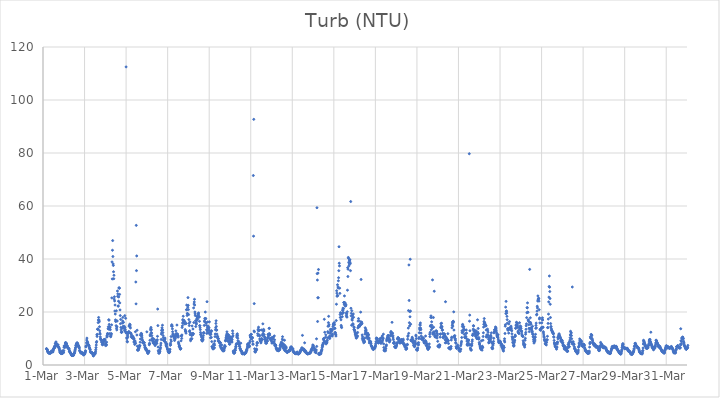
| Category | Turb (NTU) |
|---|---|
| 44986.166666666664 | 6.18 |
| 44986.177083333336 | 6.12 |
| 44986.1875 | 5.9 |
| 44986.197916666664 | 5.86 |
| 44986.208333333336 | 5.73 |
| 44986.21875 | 5.27 |
| 44986.229166666664 | 5.1 |
| 44986.239583333336 | 4.85 |
| 44986.25 | 4.82 |
| 44986.260416666664 | 4.63 |
| 44986.270833333336 | 4.62 |
| 44986.28125 | 4.55 |
| 44986.291666666664 | 4.5 |
| 44986.302083333336 | 4.49 |
| 44986.3125 | 4.48 |
| 44986.322916666664 | 4.6 |
| 44986.333333333336 | 4.53 |
| 44986.34375 | 4.53 |
| 44986.354166666664 | 4.52 |
| 44986.364583333336 | 4.47 |
| 44986.375 | 4.61 |
| 44986.385416666664 | 4.98 |
| 44986.395833333336 | 4.78 |
| 44986.40625 | 5.3 |
| 44986.416666666664 | 4.98 |
| 44986.427083333336 | 5.11 |
| 44986.4375 | 5.06 |
| 44986.447916666664 | 5.04 |
| 44986.458333333336 | 5.05 |
| 44986.46875 | 5.02 |
| 44986.479166666664 | 4.93 |
| 44986.489583333336 | 5.87 |
| 44986.5 | 5.56 |
| 44986.510416666664 | 6.14 |
| 44986.520833333336 | 6.33 |
| 44986.53125 | 6.27 |
| 44986.541666666664 | 6.72 |
| 44986.552083333336 | 6.91 |
| 44986.5625 | 7.16 |
| 44986.572916666664 | 6.56 |
| 44986.583333333336 | 7.16 |
| 44986.59375 | 8.08 |
| 44986.604166666664 | 8.12 |
| 44986.614583333336 | 8.3 |
| 44986.625 | 8.73 |
| 44986.635416666664 | 7.89 |
| 44986.645833333336 | 7.93 |
| 44986.65625 | 8.1 |
| 44986.666666666664 | 7.72 |
| 44986.677083333336 | 7.46 |
| 44986.6875 | 7.51 |
| 44986.697916666664 | 7.24 |
| 44986.708333333336 | 7.03 |
| 44986.71875 | 6.9 |
| 44986.729166666664 | 7.59 |
| 44986.739583333336 | 6.91 |
| 44986.75 | 6.83 |
| 44986.760416666664 | 6.71 |
| 44986.770833333336 | 6.43 |
| 44986.78125 | 6.29 |
| 44986.791666666664 | 5.84 |
| 44986.802083333336 | 5.43 |
| 44986.8125 | 5.01 |
| 44986.822916666664 | 4.8 |
| 44986.833333333336 | 4.74 |
| 44986.84375 | 4.54 |
| 44986.854166666664 | 4.62 |
| 44986.864583333336 | 4.36 |
| 44986.875 | 4.46 |
| 44986.885416666664 | 4.5 |
| 44986.895833333336 | 4.33 |
| 44986.90625 | 4.3 |
| 44986.916666666664 | 4.3 |
| 44986.927083333336 | 5.36 |
| 44986.9375 | 5.03 |
| 44986.947916666664 | 4.44 |
| 44986.958333333336 | 4.77 |
| 44986.96875 | 4.68 |
| 44986.979166666664 | 4.9 |
| 44986.989583333336 | 4.69 |
| 44987.0 | 5.44 |
| 44987.010416666664 | 6.67 |
| 44987.020833333336 | 7.22 |
| 44987.03125 | 7.02 |
| 44987.041666666664 | 7.05 |
| 44987.052083333336 | 6.6 |
| 44987.0625 | 7.36 |
| 44987.072916666664 | 8.28 |
| 44987.083333333336 | 8.46 |
| 44987.09375 | 8.22 |
| 44987.104166666664 | 8.01 |
| 44987.114583333336 | 8.29 |
| 44987.125 | 8.19 |
| 44987.135416666664 | 7.9 |
| 44987.145833333336 | 7.19 |
| 44987.15625 | 7.32 |
| 44987.166666666664 | 7.21 |
| 44987.177083333336 | 6.67 |
| 44987.1875 | 6.68 |
| 44987.197916666664 | 6.45 |
| 44987.208333333336 | 6.35 |
| 44987.21875 | 6.34 |
| 44987.229166666664 | 6.24 |
| 44987.239583333336 | 6.13 |
| 44987.25 | 6.21 |
| 44987.260416666664 | 5.71 |
| 44987.270833333336 | 5.1 |
| 44987.28125 | 5.09 |
| 44987.291666666664 | 5.18 |
| 44987.302083333336 | 4.8 |
| 44987.3125 | 4.66 |
| 44987.322916666664 | 4.48 |
| 44987.333333333336 | 4.47 |
| 44987.34375 | 4.23 |
| 44987.354166666664 | 4.1 |
| 44987.364583333336 | 4.06 |
| 44987.375 | 3.68 |
| 44987.385416666664 | 3.62 |
| 44987.395833333336 | 3.59 |
| 44987.40625 | 3.58 |
| 44987.416666666664 | 3.59 |
| 44987.427083333336 | 3.65 |
| 44987.4375 | 3.95 |
| 44987.447916666664 | 3.76 |
| 44987.458333333336 | 3.65 |
| 44987.46875 | 3.65 |
| 44987.479166666664 | 3.81 |
| 44987.489583333336 | 4.21 |
| 44987.5 | 4.46 |
| 44987.510416666664 | 4.4 |
| 44987.520833333336 | 4.69 |
| 44987.53125 | 5.12 |
| 44987.541666666664 | 5.51 |
| 44987.552083333336 | 5.9 |
| 44987.5625 | 6.43 |
| 44987.572916666664 | 6.68 |
| 44987.583333333336 | 7.37 |
| 44987.59375 | 7.41 |
| 44987.604166666664 | 7.74 |
| 44987.614583333336 | 8.06 |
| 44987.625 | 8.17 |
| 44987.635416666664 | 8.31 |
| 44987.645833333336 | 8.38 |
| 44987.65625 | 7.94 |
| 44987.666666666664 | 8.12 |
| 44987.677083333336 | 7.26 |
| 44987.6875 | 7.14 |
| 44987.697916666664 | 7.44 |
| 44987.708333333336 | 7.34 |
| 44987.71875 | 6.84 |
| 44987.729166666664 | 7.01 |
| 44987.739583333336 | 6.54 |
| 44987.75 | 6.38 |
| 44987.760416666664 | 5.54 |
| 44987.770833333336 | 5.32 |
| 44987.78125 | 5.24 |
| 44987.791666666664 | 4.95 |
| 44987.802083333336 | 4.99 |
| 44987.8125 | 4.64 |
| 44987.822916666664 | 4.57 |
| 44987.833333333336 | 4.54 |
| 44987.84375 | 4.57 |
| 44987.854166666664 | 4.56 |
| 44987.864583333336 | 4.56 |
| 44987.875 | 4.71 |
| 44987.885416666664 | 4.41 |
| 44987.895833333336 | 4.39 |
| 44987.90625 | 4.26 |
| 44987.916666666664 | 4.5 |
| 44987.927083333336 | 4.48 |
| 44987.9375 | 4.16 |
| 44987.947916666664 | 3.76 |
| 44987.958333333336 | 4.1 |
| 44987.96875 | 4.22 |
| 44987.979166666664 | 3.91 |
| 44987.989583333336 | 4.11 |
| 44988.0 | 4.05 |
| 44988.010416666664 | 4.35 |
| 44988.020833333336 | 4.61 |
| 44988.03125 | 4.64 |
| 44988.041666666664 | 5.21 |
| 44988.052083333336 | 5.35 |
| 44988.0625 | 6.8 |
| 44988.072916666664 | 7.1 |
| 44988.083333333336 | 7.31 |
| 44988.09375 | 8.34 |
| 44988.104166666664 | 9.41 |
| 44988.114583333336 | 10.14 |
| 44988.125 | 8.61 |
| 44988.135416666664 | 8.88 |
| 44988.145833333336 | 8.5 |
| 44988.15625 | 8.3 |
| 44988.166666666664 | 7.91 |
| 44988.177083333336 | 7.51 |
| 44988.1875 | 7.52 |
| 44988.197916666664 | 7.39 |
| 44988.208333333336 | 7.39 |
| 44988.21875 | 7.16 |
| 44988.229166666664 | 6.7 |
| 44988.239583333336 | 6.32 |
| 44988.25 | 6.32 |
| 44988.260416666664 | 5.88 |
| 44988.270833333336 | 5.74 |
| 44988.28125 | 5.15 |
| 44988.291666666664 | 4.84 |
| 44988.302083333336 | 4.69 |
| 44988.3125 | 4.85 |
| 44988.322916666664 | 4.64 |
| 44988.333333333336 | 4.63 |
| 44988.34375 | 4.67 |
| 44988.354166666664 | 4.57 |
| 44988.364583333336 | 4.6 |
| 44988.375 | 4.52 |
| 44988.385416666664 | 4.45 |
| 44988.395833333336 | 4.15 |
| 44988.40625 | 4.08 |
| 44988.416666666664 | 3.51 |
| 44988.427083333336 | 3.41 |
| 44988.4375 | 3.85 |
| 44988.447916666664 | 4.25 |
| 44988.458333333336 | 4 |
| 44988.46875 | 3.87 |
| 44988.479166666664 | 4.38 |
| 44988.489583333336 | 4.07 |
| 44988.5 | 4.19 |
| 44988.510416666664 | 4.36 |
| 44988.520833333336 | 4.64 |
| 44988.53125 | 5.17 |
| 44988.541666666664 | 5.81 |
| 44988.552083333336 | 6.57 |
| 44988.5625 | 7.53 |
| 44988.572916666664 | 8.5 |
| 44988.583333333336 | 8.88 |
| 44988.59375 | 11.39 |
| 44988.604166666664 | 10.77 |
| 44988.614583333336 | 11.56 |
| 44988.625 | 13.47 |
| 44988.635416666664 | 13.53 |
| 44988.645833333336 | 13.52 |
| 44988.65625 | 16 |
| 44988.666666666664 | 17.01 |
| 44988.677083333336 | 17.94 |
| 44988.6875 | 16.87 |
| 44988.697916666664 | 16.96 |
| 44988.708333333336 | 16.32 |
| 44988.71875 | 14.43 |
| 44988.729166666664 | 12.91 |
| 44988.739583333336 | 11.99 |
| 44988.75 | 11.63 |
| 44988.760416666664 | 10.58 |
| 44988.770833333336 | 9.96 |
| 44988.78125 | 9.56 |
| 44988.791666666664 | 9.44 |
| 44988.802083333336 | 9.56 |
| 44988.8125 | 9.43 |
| 44988.822916666664 | 8.65 |
| 44988.833333333336 | 9.01 |
| 44988.84375 | 8.42 |
| 44988.854166666664 | 7.78 |
| 44988.864583333336 | 7.63 |
| 44988.875 | 7.7 |
| 44988.885416666664 | 7.94 |
| 44988.895833333336 | 8.6 |
| 44988.90625 | 8.61 |
| 44988.916666666664 | 8.94 |
| 44988.927083333336 | 9.29 |
| 44988.9375 | 9.59 |
| 44988.947916666664 | 9.4 |
| 44988.958333333336 | 9.59 |
| 44988.96875 | 9.64 |
| 44988.979166666664 | 9.59 |
| 44988.989583333336 | 9.13 |
| 44989.0 | 8.08 |
| 44989.010416666664 | 7.32 |
| 44989.020833333336 | 7.73 |
| 44989.03125 | 7.8 |
| 44989.041666666664 | 7.79 |
| 44989.052083333336 | 7.47 |
| 44989.0625 | 8.61 |
| 44989.072916666664 | 10.52 |
| 44989.083333333336 | 11.16 |
| 44989.09375 | 10.86 |
| 44989.104166666664 | 11.89 |
| 44989.114583333336 | 11.66 |
| 44989.125 | 11.77 |
| 44989.135416666664 | 13.71 |
| 44989.145833333336 | 14.44 |
| 44989.15625 | 13.54 |
| 44989.166666666664 | 17.09 |
| 44989.177083333336 | 16.89 |
| 44989.1875 | 15.32 |
| 44989.197916666664 | 13.7 |
| 44989.208333333336 | 14.44 |
| 44989.21875 | 11.87 |
| 44989.229166666664 | 14.08 |
| 44989.239583333336 | 13.31 |
| 44989.25 | 10.86 |
| 44989.260416666664 | 10.65 |
| 44989.270833333336 | 11.08 |
| 44989.28125 | 11.62 |
| 44989.291666666664 | 11.84 |
| 44989.302083333336 | 15.15 |
| 44989.3125 | 25.32 |
| 44989.322916666664 | 38.91 |
| 44989.333333333336 | 32.48 |
| 44989.34375 | 43.3 |
| 44989.354166666664 | 46.95 |
| 44989.364583333336 | 40.94 |
| 44989.375 | 38.16 |
| 44989.385416666664 | 37.57 |
| 44989.395833333336 | 35.18 |
| 44989.40625 | 32.56 |
| 44989.416666666664 | 33.85 |
| 44989.427083333336 | 24.85 |
| 44989.4375 | 25.73 |
| 44989.447916666664 | 24.17 |
| 44989.458333333336 | 20.37 |
| 44989.46875 | 22.63 |
| 44989.479166666664 | 19.23 |
| 44989.489583333336 | 17.03 |
| 44989.5 | 16.41 |
| 44989.510416666664 | 16.6 |
| 44989.520833333336 | 14.83 |
| 44989.53125 | 20.45 |
| 44989.541666666664 | 13.9 |
| 44989.552083333336 | 13.25 |
| 44989.5625 | 14.42 |
| 44989.572916666664 | 16.61 |
| 44989.583333333336 | 27.91 |
| 44989.59375 | 25.92 |
| 44989.604166666664 | 26.84 |
| 44989.614583333336 | 22.23 |
| 44989.625 | 22.25 |
| 44989.635416666664 | 24.06 |
| 44989.645833333336 | 25.69 |
| 44989.65625 | 29.14 |
| 44989.666666666664 | 29 |
| 44989.677083333336 | 29 |
| 44989.6875 | 26.64 |
| 44989.697916666664 | 23.42 |
| 44989.708333333336 | 20.77 |
| 44989.71875 | 18.66 |
| 44989.729166666664 | 15.59 |
| 44989.739583333336 | 17.21 |
| 44989.75 | 14.17 |
| 44989.760416666664 | 13.27 |
| 44989.770833333336 | 12.32 |
| 44989.78125 | 12.36 |
| 44989.791666666664 | 12.39 |
| 44989.802083333336 | 12.5 |
| 44989.8125 | 13.92 |
| 44989.822916666664 | 15.82 |
| 44989.833333333336 | 16.6 |
| 44989.84375 | 17.97 |
| 44989.854166666664 | 14.15 |
| 44989.864583333336 | 14.62 |
| 44989.875 | 16.1 |
| 44989.885416666664 | 14.27 |
| 44989.895833333336 | 13.9 |
| 44989.90625 | 14.02 |
| 44989.916666666664 | 14.59 |
| 44989.927083333336 | 13.06 |
| 44989.9375 | 18.62 |
| 44989.947916666664 | 14.09 |
| 44989.958333333336 | 13.33 |
| 44989.96875 | 12.68 |
| 44989.979166666664 | 17.62 |
| 44989.989583333336 | 12.21 |
| 44990.0 | 112.49 |
| 44990.010416666664 | 12.25 |
| 44990.020833333336 | 11.98 |
| 44990.03125 | 10.29 |
| 44990.041666666664 | 9.97 |
| 44990.052083333336 | 8.93 |
| 44990.0625 | 8.71 |
| 44990.072916666664 | 11.21 |
| 44990.083333333336 | 10.55 |
| 44990.09375 | 11.98 |
| 44990.104166666664 | 12.37 |
| 44990.114583333336 | 11.99 |
| 44990.125 | 12.37 |
| 44990.135416666664 | 12.62 |
| 44990.145833333336 | 14.63 |
| 44990.15625 | 14.93 |
| 44990.166666666664 | 14.77 |
| 44990.177083333336 | 15.41 |
| 44990.1875 | 14.4 |
| 44990.197916666664 | 15.1 |
| 44990.208333333336 | 13.98 |
| 44990.21875 | 12.08 |
| 44990.229166666664 | 11.99 |
| 44990.239583333336 | 11.71 |
| 44990.25 | 10.77 |
| 44990.260416666664 | 11.34 |
| 44990.270833333336 | 10.38 |
| 44990.28125 | 10.6 |
| 44990.291666666664 | 10.32 |
| 44990.302083333336 | 10.56 |
| 44990.3125 | 10.21 |
| 44990.322916666664 | 10.15 |
| 44990.333333333336 | 10.77 |
| 44990.34375 | 10.19 |
| 44990.354166666664 | 10.15 |
| 44990.364583333336 | 9.9 |
| 44990.375 | 8.66 |
| 44990.385416666664 | 9.85 |
| 44990.395833333336 | 8.82 |
| 44990.40625 | 9.06 |
| 44990.416666666664 | 7.76 |
| 44990.427083333336 | 8.08 |
| 44990.4375 | 9 |
| 44990.447916666664 | 12.56 |
| 44990.458333333336 | 8.24 |
| 44990.46875 | 31.32 |
| 44990.479166666664 | 23.07 |
| 44990.489583333336 | 52.69 |
| 44990.5 | 35.61 |
| 44990.510416666664 | 41.16 |
| 44990.520833333336 | 11.32 |
| 44990.53125 | 13.12 |
| 44990.541666666664 | 7.08 |
| 44990.552083333336 | 5.55 |
| 44990.5625 | 5.92 |
| 44990.572916666664 | 5.82 |
| 44990.583333333336 | 5.64 |
| 44990.59375 | 5.68 |
| 44990.604166666664 | 6.55 |
| 44990.614583333336 | 6.21 |
| 44990.625 | 6.54 |
| 44990.635416666664 | 7.22 |
| 44990.645833333336 | 7.39 |
| 44990.65625 | 7.21 |
| 44990.666666666664 | 7.25 |
| 44990.677083333336 | 8.63 |
| 44990.6875 | 9.83 |
| 44990.697916666664 | 11.24 |
| 44990.708333333336 | 11.64 |
| 44990.71875 | 11.17 |
| 44990.729166666664 | 11.94 |
| 44990.739583333336 | 11.57 |
| 44990.75 | 11.75 |
| 44990.760416666664 | 10.98 |
| 44990.770833333336 | 10.21 |
| 44990.78125 | 9.44 |
| 44990.791666666664 | 9.23 |
| 44990.802083333336 | 8.39 |
| 44990.8125 | 8.38 |
| 44990.822916666664 | 8.58 |
| 44990.833333333336 | 8.63 |
| 44990.84375 | 8.42 |
| 44990.854166666664 | 8.34 |
| 44990.864583333336 | 8.36 |
| 44990.875 | 8.41 |
| 44990.885416666664 | 7.53 |
| 44990.895833333336 | 7.3 |
| 44990.90625 | 6.72 |
| 44990.916666666664 | 6.68 |
| 44990.927083333336 | 6.19 |
| 44990.9375 | 6.33 |
| 44990.947916666664 | 5.9 |
| 44990.958333333336 | 5.65 |
| 44990.96875 | 6.11 |
| 44990.979166666664 | 5.6 |
| 44990.989583333336 | 5.5 |
| 44991.0 | 12.51 |
| 44991.010416666664 | 5.39 |
| 44991.020833333336 | 5.07 |
| 44991.03125 | 4.75 |
| 44991.041666666664 | 4.48 |
| 44991.052083333336 | 4.34 |
| 44991.0625 | 4.79 |
| 44991.072916666664 | 4.67 |
| 44991.083333333336 | 4.8 |
| 44991.09375 | 5.14 |
| 44991.104166666664 | 5.25 |
| 44991.114583333336 | 7.62 |
| 44991.125 | 8.19 |
| 44991.135416666664 | 8 |
| 44991.145833333336 | 9.32 |
| 44991.15625 | 11.02 |
| 44991.166666666664 | 11.54 |
| 44991.177083333336 | 13.25 |
| 44991.1875 | 13.72 |
| 44991.197916666664 | 14.18 |
| 44991.208333333336 | 12.24 |
| 44991.21875 | 13.3 |
| 44991.229166666664 | 12.03 |
| 44991.239583333336 | 11.07 |
| 44991.25 | 9.93 |
| 44991.260416666664 | 9.35 |
| 44991.270833333336 | 9.28 |
| 44991.28125 | 10.11 |
| 44991.291666666664 | 8.9 |
| 44991.302083333336 | 8.4 |
| 44991.3125 | 8.23 |
| 44991.322916666664 | 8.69 |
| 44991.333333333336 | 8.67 |
| 44991.34375 | 9.75 |
| 44991.354166666664 | 8.67 |
| 44991.364583333336 | 7.86 |
| 44991.375 | 7.97 |
| 44991.385416666664 | 8.12 |
| 44991.395833333336 | 7.34 |
| 44991.40625 | 7.66 |
| 44991.416666666664 | 8.11 |
| 44991.427083333336 | 8.36 |
| 44991.4375 | 9.22 |
| 44991.447916666664 | 8.54 |
| 44991.458333333336 | 8.17 |
| 44991.46875 | 9.26 |
| 44991.479166666664 | 8.14 |
| 44991.489583333336 | 9.08 |
| 44991.5 | 9.54 |
| 44991.510416666664 | 10.82 |
| 44991.520833333336 | 21.11 |
| 44991.53125 | 14.87 |
| 44991.541666666664 | 6.78 |
| 44991.552083333336 | 5.45 |
| 44991.5625 | 5.13 |
| 44991.572916666664 | 4.47 |
| 44991.583333333336 | 4.53 |
| 44991.59375 | 4.53 |
| 44991.604166666664 | 4.64 |
| 44991.614583333336 | 4.97 |
| 44991.625 | 5.12 |
| 44991.635416666664 | 5.76 |
| 44991.645833333336 | 6.31 |
| 44991.65625 | 6.64 |
| 44991.666666666664 | 7.5 |
| 44991.677083333336 | 8.24 |
| 44991.6875 | 9.63 |
| 44991.697916666664 | 11.68 |
| 44991.708333333336 | 13.01 |
| 44991.71875 | 12.18 |
| 44991.729166666664 | 14.05 |
| 44991.739583333336 | 13.45 |
| 44991.75 | 15.02 |
| 44991.760416666664 | 13.16 |
| 44991.770833333336 | 12.23 |
| 44991.78125 | 11.12 |
| 44991.791666666664 | 10.27 |
| 44991.802083333336 | 9.41 |
| 44991.8125 | 9.35 |
| 44991.822916666664 | 9.3 |
| 44991.833333333336 | 9.04 |
| 44991.84375 | 9.74 |
| 44991.854166666664 | 9.51 |
| 44991.864583333336 | 10.23 |
| 44991.875 | 9.83 |
| 44991.885416666664 | 8.75 |
| 44991.895833333336 | 8.51 |
| 44991.90625 | 8.42 |
| 44991.916666666664 | 7.96 |
| 44991.927083333336 | 7.27 |
| 44991.9375 | 7.73 |
| 44991.947916666664 | 6.98 |
| 44991.958333333336 | 6.91 |
| 44991.96875 | 7.9 |
| 44991.979166666664 | 6.43 |
| 44991.989583333336 | 6.08 |
| 44992.0 | 5.86 |
| 44992.010416666664 | 5.66 |
| 44992.020833333336 | 5.28 |
| 44992.03125 | 5.03 |
| 44992.041666666664 | 4.97 |
| 44992.052083333336 | 4.72 |
| 44992.0625 | 4.71 |
| 44992.072916666664 | 4.63 |
| 44992.083333333336 | 4.9 |
| 44992.09375 | 4.86 |
| 44992.104166666664 | 5.19 |
| 44992.114583333336 | 5.95 |
| 44992.125 | 7.44 |
| 44992.135416666664 | 8.23 |
| 44992.145833333336 | 7.6 |
| 44992.15625 | 9.49 |
| 44992.166666666664 | 10.74 |
| 44992.177083333336 | 8.97 |
| 44992.1875 | 14.72 |
| 44992.197916666664 | 15.2 |
| 44992.208333333336 | 14.75 |
| 44992.21875 | 14.64 |
| 44992.229166666664 | 13.65 |
| 44992.239583333336 | 12.56 |
| 44992.25 | 11.69 |
| 44992.260416666664 | 11.53 |
| 44992.270833333336 | 10.8 |
| 44992.28125 | 10.82 |
| 44992.291666666664 | 10.91 |
| 44992.302083333336 | 10.58 |
| 44992.3125 | 11 |
| 44992.322916666664 | 9.98 |
| 44992.333333333336 | 9.25 |
| 44992.34375 | 10.03 |
| 44992.354166666664 | 9.78 |
| 44992.364583333336 | 10.12 |
| 44992.375 | 10.66 |
| 44992.385416666664 | 11.68 |
| 44992.395833333336 | 12.88 |
| 44992.40625 | 11.67 |
| 44992.416666666664 | 11.31 |
| 44992.427083333336 | 11.19 |
| 44992.4375 | 11.83 |
| 44992.447916666664 | 15.08 |
| 44992.458333333336 | 10.98 |
| 44992.46875 | 10.69 |
| 44992.479166666664 | 11.67 |
| 44992.489583333336 | 10.68 |
| 44992.5 | 11.09 |
| 44992.510416666664 | 10.54 |
| 44992.520833333336 | 8.62 |
| 44992.53125 | 8.17 |
| 44992.541666666664 | 7.82 |
| 44992.552083333336 | 7.09 |
| 44992.5625 | 7.18 |
| 44992.572916666664 | 7.2 |
| 44992.583333333336 | 6.57 |
| 44992.59375 | 6.46 |
| 44992.604166666664 | 6.05 |
| 44992.614583333336 | 6.05 |
| 44992.625 | 6.05 |
| 44992.635416666664 | 6.22 |
| 44992.645833333336 | 9.12 |
| 44992.65625 | 10.97 |
| 44992.666666666664 | 10.98 |
| 44992.677083333336 | 10.03 |
| 44992.6875 | 11.33 |
| 44992.697916666664 | 14.16 |
| 44992.708333333336 | 14.8 |
| 44992.71875 | 15.84 |
| 44992.729166666664 | 17.13 |
| 44992.739583333336 | 16.75 |
| 44992.75 | 18.4 |
| 44992.760416666664 | 16.65 |
| 44992.770833333336 | 15.77 |
| 44992.78125 | 16.06 |
| 44992.791666666664 | 16.83 |
| 44992.802083333336 | 16.39 |
| 44992.8125 | 15.71 |
| 44992.822916666664 | 16.36 |
| 44992.833333333336 | 15.47 |
| 44992.84375 | 13.36 |
| 44992.854166666664 | 12.88 |
| 44992.864583333336 | 12.52 |
| 44992.875 | 12.71 |
| 44992.885416666664 | 12.01 |
| 44992.895833333336 | 15.68 |
| 44992.90625 | 20.86 |
| 44992.916666666664 | 22.61 |
| 44992.927083333336 | 20.91 |
| 44992.9375 | 18.69 |
| 44992.947916666664 | 19.44 |
| 44992.958333333336 | 19.37 |
| 44992.96875 | 21.82 |
| 44992.979166666664 | 25.43 |
| 44992.989583333336 | 22.52 |
| 44993.0 | 20.91 |
| 44993.010416666664 | 19.03 |
| 44993.020833333336 | 17.15 |
| 44993.03125 | 15.72 |
| 44993.041666666664 | 14.87 |
| 44993.052083333336 | 12.6 |
| 44993.0625 | 12.95 |
| 44993.072916666664 | 16.27 |
| 44993.083333333336 | 11.44 |
| 44993.09375 | 12.13 |
| 44993.104166666664 | 9.15 |
| 44993.114583333336 | 9.78 |
| 44993.125 | 9.81 |
| 44993.135416666664 | 9.66 |
| 44993.145833333336 | 11.4 |
| 44993.15625 | 11.13 |
| 44993.166666666664 | 9.96 |
| 44993.177083333336 | 14.73 |
| 44993.1875 | 11.91 |
| 44993.197916666664 | 11.54 |
| 44993.208333333336 | 11.39 |
| 44993.21875 | 13.59 |
| 44993.229166666664 | 11.86 |
| 44993.239583333336 | 11.74 |
| 44993.25 | 21.54 |
| 44993.260416666664 | 16.03 |
| 44993.270833333336 | 23.01 |
| 44993.28125 | 23.78 |
| 44993.291666666664 | 24.79 |
| 44993.302083333336 | 22.62 |
| 44993.3125 | 20 |
| 44993.322916666664 | 19.31 |
| 44993.333333333336 | 18.63 |
| 44993.34375 | 16.74 |
| 44993.354166666664 | 14.52 |
| 44993.364583333336 | 15.91 |
| 44993.375 | 15.83 |
| 44993.385416666664 | 15.45 |
| 44993.395833333336 | 16.74 |
| 44993.40625 | 17.46 |
| 44993.416666666664 | 18.27 |
| 44993.427083333336 | 17.66 |
| 44993.4375 | 17.26 |
| 44993.447916666664 | 18.24 |
| 44993.458333333336 | 18.85 |
| 44993.46875 | 19.33 |
| 44993.479166666664 | 19.07 |
| 44993.489583333336 | 19.64 |
| 44993.5 | 18.36 |
| 44993.510416666664 | 18.11 |
| 44993.520833333336 | 18.11 |
| 44993.53125 | 16.48 |
| 44993.541666666664 | 14.83 |
| 44993.552083333336 | 14.82 |
| 44993.5625 | 14.06 |
| 44993.572916666664 | 13.33 |
| 44993.583333333336 | 12.29 |
| 44993.59375 | 11.56 |
| 44993.604166666664 | 11.54 |
| 44993.614583333336 | 11.11 |
| 44993.625 | 10.58 |
| 44993.635416666664 | 9.6 |
| 44993.645833333336 | 9.4 |
| 44993.65625 | 9.14 |
| 44993.666666666664 | 9.03 |
| 44993.677083333336 | 9.6 |
| 44993.6875 | 10.09 |
| 44993.697916666664 | 10.29 |
| 44993.708333333336 | 9.49 |
| 44993.71875 | 11.04 |
| 44993.729166666664 | 12.22 |
| 44993.739583333336 | 11.96 |
| 44993.75 | 12.16 |
| 44993.760416666664 | 14.94 |
| 44993.770833333336 | 16.61 |
| 44993.78125 | 16.29 |
| 44993.791666666664 | 17.58 |
| 44993.802083333336 | 17.37 |
| 44993.8125 | 19.98 |
| 44993.822916666664 | 17.45 |
| 44993.833333333336 | 17.57 |
| 44993.84375 | 15.95 |
| 44993.854166666664 | 15.9 |
| 44993.864583333336 | 15 |
| 44993.875 | 13.28 |
| 44993.885416666664 | 11.91 |
| 44993.895833333336 | 23.89 |
| 44993.90625 | 12.81 |
| 44993.916666666664 | 14.16 |
| 44993.927083333336 | 16.24 |
| 44993.9375 | 13.63 |
| 44993.947916666664 | 14.67 |
| 44993.958333333336 | 12.07 |
| 44993.96875 | 13.14 |
| 44993.979166666664 | 14.18 |
| 44993.989583333336 | 14.01 |
| 44994.0 | 13.11 |
| 44994.010416666664 | 16.28 |
| 44994.020833333336 | 12.08 |
| 44994.03125 | 12.39 |
| 44994.041666666664 | 11.69 |
| 44994.052083333336 | 11.42 |
| 44994.0625 | 10.27 |
| 44994.072916666664 | 12.27 |
| 44994.083333333336 | 11.63 |
| 44994.09375 | 12.88 |
| 44994.104166666664 | 10.41 |
| 44994.114583333336 | 12.86 |
| 44994.125 | 8.84 |
| 44994.135416666664 | 6.96 |
| 44994.145833333336 | 6.83 |
| 44994.15625 | 6.69 |
| 44994.166666666664 | 6.42 |
| 44994.177083333336 | 6.08 |
| 44994.1875 | 6.6 |
| 44994.197916666664 | 6.12 |
| 44994.208333333336 | 7.73 |
| 44994.21875 | 6.45 |
| 44994.229166666664 | 6.33 |
| 44994.239583333336 | 8.08 |
| 44994.25 | 6.52 |
| 44994.260416666664 | 7.51 |
| 44994.270833333336 | 9.03 |
| 44994.28125 | 10.71 |
| 44994.291666666664 | 11.68 |
| 44994.302083333336 | 13.28 |
| 44994.3125 | 14.06 |
| 44994.322916666664 | 15.68 |
| 44994.333333333336 | 16.7 |
| 44994.34375 | 14.57 |
| 44994.354166666664 | 13.12 |
| 44994.364583333336 | 13.22 |
| 44994.375 | 11.66 |
| 44994.385416666664 | 10.62 |
| 44994.395833333336 | 10.79 |
| 44994.40625 | 10.75 |
| 44994.416666666664 | 10.1 |
| 44994.427083333336 | 10 |
| 44994.4375 | 9.14 |
| 44994.447916666664 | 9.93 |
| 44994.458333333336 | 8.87 |
| 44994.46875 | 8.99 |
| 44994.479166666664 | 8.92 |
| 44994.489583333336 | 8.54 |
| 44994.5 | 8.67 |
| 44994.510416666664 | 8.17 |
| 44994.520833333336 | 7.25 |
| 44994.53125 | 8.42 |
| 44994.541666666664 | 8.4 |
| 44994.552083333336 | 7.38 |
| 44994.5625 | 6.57 |
| 44994.572916666664 | 6.57 |
| 44994.583333333336 | 6.29 |
| 44994.59375 | 6.17 |
| 44994.604166666664 | 7.6 |
| 44994.614583333336 | 6.08 |
| 44994.625 | 5.68 |
| 44994.635416666664 | 6.18 |
| 44994.645833333336 | 6.4 |
| 44994.65625 | 5.35 |
| 44994.666666666664 | 5.49 |
| 44994.677083333336 | 5.35 |
| 44994.6875 | 5.49 |
| 44994.697916666664 | 5.52 |
| 44994.708333333336 | 5.33 |
| 44994.71875 | 5.69 |
| 44994.729166666664 | 6.22 |
| 44994.739583333336 | 6.88 |
| 44994.75 | 7.39 |
| 44994.760416666664 | 7.08 |
| 44994.770833333336 | 6.92 |
| 44994.78125 | 9.16 |
| 44994.791666666664 | 9.14 |
| 44994.802083333336 | 9.75 |
| 44994.8125 | 10.36 |
| 44994.822916666664 | 10.98 |
| 44994.833333333336 | 10.06 |
| 44994.84375 | 11.66 |
| 44994.854166666664 | 12.52 |
| 44994.864583333336 | 11.56 |
| 44994.875 | 10.78 |
| 44994.885416666664 | 9.86 |
| 44994.895833333336 | 8.98 |
| 44994.90625 | 9.1 |
| 44994.916666666664 | 11.48 |
| 44994.927083333336 | 10.07 |
| 44994.9375 | 11.25 |
| 44994.947916666664 | 10.63 |
| 44994.958333333336 | 8.7 |
| 44994.96875 | 7.91 |
| 44994.979166666664 | 9.23 |
| 44994.989583333336 | 7.84 |
| 44995.0 | 8.71 |
| 44995.010416666664 | 9.93 |
| 44995.020833333336 | 10.63 |
| 44995.03125 | 9.5 |
| 44995.041666666664 | 9.91 |
| 44995.052083333336 | 8.95 |
| 44995.0625 | 8.88 |
| 44995.072916666664 | 9.93 |
| 44995.083333333336 | 8.91 |
| 44995.09375 | 8.61 |
| 44995.104166666664 | 9.59 |
| 44995.114583333336 | 10.6 |
| 44995.125 | 12.88 |
| 44995.135416666664 | 11.87 |
| 44995.145833333336 | 11.01 |
| 44995.15625 | 5.26 |
| 44995.166666666664 | 4.97 |
| 44995.177083333336 | 4.68 |
| 44995.1875 | 4.49 |
| 44995.197916666664 | 4.46 |
| 44995.208333333336 | 4.49 |
| 44995.21875 | 4.66 |
| 44995.229166666664 | 4.79 |
| 44995.239583333336 | 5.8 |
| 44995.25 | 5.6 |
| 44995.260416666664 | 5.52 |
| 44995.270833333336 | 6.38 |
| 44995.28125 | 7.09 |
| 44995.291666666664 | 6.89 |
| 44995.302083333336 | 7.77 |
| 44995.3125 | 8.07 |
| 44995.322916666664 | 10.55 |
| 44995.333333333336 | 11.15 |
| 44995.34375 | 11.54 |
| 44995.354166666664 | 11.77 |
| 44995.364583333336 | 11 |
| 44995.375 | 10.1 |
| 44995.385416666664 | 9.16 |
| 44995.395833333336 | 8.63 |
| 44995.40625 | 7.82 |
| 44995.416666666664 | 8.86 |
| 44995.427083333336 | 8.1 |
| 44995.4375 | 8.1 |
| 44995.447916666664 | 7.71 |
| 44995.458333333336 | 7 |
| 44995.46875 | 7.04 |
| 44995.479166666664 | 6.19 |
| 44995.489583333336 | 6.32 |
| 44995.5 | 6.01 |
| 44995.510416666664 | 5.65 |
| 44995.520833333336 | 8.24 |
| 44995.53125 | 5.49 |
| 44995.541666666664 | 5.2 |
| 44995.552083333336 | 5.23 |
| 44995.5625 | 5.08 |
| 44995.572916666664 | 4.62 |
| 44995.583333333336 | 4.31 |
| 44995.59375 | 4.45 |
| 44995.604166666664 | 4.26 |
| 44995.614583333336 | 4.23 |
| 44995.625 | 4.42 |
| 44995.635416666664 | 4.35 |
| 44995.645833333336 | 4.42 |
| 44995.65625 | 4.35 |
| 44995.666666666664 | 4.34 |
| 44995.677083333336 | 4.32 |
| 44995.6875 | 4.08 |
| 44995.697916666664 | 4.28 |
| 44995.708333333336 | 4.21 |
| 44995.71875 | 4.28 |
| 44995.729166666664 | 4.56 |
| 44995.739583333336 | 4.49 |
| 44995.75 | 4.72 |
| 44995.760416666664 | 4.55 |
| 44995.770833333336 | 4.69 |
| 44995.78125 | 5.08 |
| 44995.791666666664 | 5.32 |
| 44995.802083333336 | 5.82 |
| 44995.8125 | 5.6 |
| 44995.822916666664 | 6.07 |
| 44995.833333333336 | 6.78 |
| 44995.84375 | 7.53 |
| 44995.854166666664 | 7.84 |
| 44995.864583333336 | 7.93 |
| 44995.875 | 8 |
| 44995.885416666664 | 7.94 |
| 44995.895833333336 | 7.35 |
| 44995.90625 | 6.73 |
| 44995.916666666664 | 6.9 |
| 44995.927083333336 | 7.27 |
| 44995.9375 | 7.04 |
| 44995.947916666664 | 8.43 |
| 44995.958333333336 | 9.02 |
| 44995.96875 | 11.24 |
| 44995.979166666664 | 10.6 |
| 44995.989583333336 | 10.56 |
| 44996.0 | 10.57 |
| 44996.010416666664 | 9.82 |
| 44996.020833333336 | 11.58 |
| 44996.03125 | 11.53 |
| 44996.041666666664 | 10.26 |
| 44996.052083333336 | 9.96 |
| 44996.0625 | 10.1 |
| 44996.072916666664 | 10.29 |
| 44996.083333333336 | 10.37 |
| 44996.09375 | 8.92 |
| 44996.104166666664 | 7.85 |
| 44996.114583333336 | 7.88 |
| 44996.125 | 71.5 |
| 44996.135416666664 | 48.62 |
| 44996.145833333336 | 92.7 |
| 44996.15625 | 12.83 |
| 44996.166666666664 | 23.16 |
| 44996.177083333336 | 12.53 |
| 44996.1875 | 6.13 |
| 44996.197916666664 | 5.16 |
| 44996.208333333336 | 4.89 |
| 44996.21875 | 4.96 |
| 44996.229166666664 | 5.02 |
| 44996.239583333336 | 5.62 |
| 44996.25 | 5.39 |
| 44996.260416666664 | 5.61 |
| 44996.270833333336 | 6.06 |
| 44996.28125 | 5.84 |
| 44996.291666666664 | 7.41 |
| 44996.302083333336 | 8.26 |
| 44996.3125 | 8.53 |
| 44996.322916666664 | 8.27 |
| 44996.333333333336 | 11.81 |
| 44996.34375 | 11.12 |
| 44996.354166666664 | 13.45 |
| 44996.364583333336 | 12.95 |
| 44996.375 | 14.27 |
| 44996.385416666664 | 13.27 |
| 44996.395833333336 | 13.24 |
| 44996.40625 | 12.99 |
| 44996.416666666664 | 11.3 |
| 44996.427083333336 | 10.95 |
| 44996.4375 | 9.88 |
| 44996.447916666664 | 9.52 |
| 44996.458333333336 | 9.28 |
| 44996.46875 | 9.01 |
| 44996.479166666664 | 8.9 |
| 44996.489583333336 | 8.34 |
| 44996.5 | 8.72 |
| 44996.510416666664 | 13.21 |
| 44996.520833333336 | 10.01 |
| 44996.53125 | 9.69 |
| 44996.541666666664 | 9.77 |
| 44996.552083333336 | 9.53 |
| 44996.5625 | 11.14 |
| 44996.572916666664 | 11.51 |
| 44996.583333333336 | 15.53 |
| 44996.59375 | 11.91 |
| 44996.604166666664 | 12.99 |
| 44996.614583333336 | 13.44 |
| 44996.625 | 12.75 |
| 44996.635416666664 | 13.18 |
| 44996.645833333336 | 11.41 |
| 44996.65625 | 10.7 |
| 44996.666666666664 | 9.68 |
| 44996.677083333336 | 10.25 |
| 44996.6875 | 9.66 |
| 44996.697916666664 | 10.25 |
| 44996.708333333336 | 8.9 |
| 44996.71875 | 8.24 |
| 44996.729166666664 | 8.79 |
| 44996.739583333336 | 8.33 |
| 44996.75 | 8.64 |
| 44996.760416666664 | 8.2 |
| 44996.770833333336 | 9.24 |
| 44996.78125 | 9.43 |
| 44996.791666666664 | 8.98 |
| 44996.802083333336 | 9.03 |
| 44996.8125 | 10.24 |
| 44996.822916666664 | 10.06 |
| 44996.833333333336 | 11.52 |
| 44996.84375 | 10.84 |
| 44996.854166666664 | 11.51 |
| 44996.864583333336 | 11.48 |
| 44996.875 | 11.78 |
| 44996.885416666664 | 13.84 |
| 44996.895833333336 | 13.83 |
| 44996.90625 | 11.8 |
| 44996.916666666664 | 11.29 |
| 44996.927083333336 | 10.06 |
| 44996.9375 | 9.77 |
| 44996.947916666664 | 9.89 |
| 44996.958333333336 | 9.54 |
| 44996.96875 | 9.45 |
| 44996.979166666664 | 10.03 |
| 44996.989583333336 | 9.41 |
| 44997.0 | 10.32 |
| 44997.010416666664 | 8.88 |
| 44997.020833333336 | 8.25 |
| 44997.03125 | 8.35 |
| 44997.041666666664 | 8.58 |
| 44997.052083333336 | 9.83 |
| 44997.0625 | 10.24 |
| 44997.072916666664 | 10.27 |
| 44997.083333333336 | 10.55 |
| 44997.09375 | 8.61 |
| 44997.104166666664 | 8.29 |
| 44997.114583333336 | 8.62 |
| 44997.125 | 8.74 |
| 44997.135416666664 | 10.97 |
| 44997.145833333336 | 9.52 |
| 44997.15625 | 7.32 |
| 44997.166666666664 | 7.59 |
| 44997.177083333336 | 7.74 |
| 44997.1875 | 7.53 |
| 44997.197916666664 | 7.53 |
| 44997.208333333336 | 7.25 |
| 44997.21875 | 6.45 |
| 44997.229166666664 | 6.36 |
| 44997.239583333336 | 6.34 |
| 44997.25 | 5.9 |
| 44997.260416666664 | 5.66 |
| 44997.270833333336 | 5.85 |
| 44997.28125 | 5.46 |
| 44997.291666666664 | 5.6 |
| 44997.302083333336 | 5.65 |
| 44997.3125 | 5.59 |
| 44997.322916666664 | 5.47 |
| 44997.333333333336 | 5.51 |
| 44997.34375 | 5.37 |
| 44997.354166666664 | 6.1 |
| 44997.364583333336 | 5.7 |
| 44997.375 | 6.07 |
| 44997.385416666664 | 5.75 |
| 44997.395833333336 | 5.79 |
| 44997.40625 | 6.25 |
| 44997.416666666664 | 7.39 |
| 44997.427083333336 | 6.86 |
| 44997.4375 | 7.64 |
| 44997.447916666664 | 7.75 |
| 44997.458333333336 | 8.08 |
| 44997.46875 | 8.58 |
| 44997.479166666664 | 7.89 |
| 44997.489583333336 | 7.13 |
| 44997.5 | 7.28 |
| 44997.510416666664 | 8.28 |
| 44997.520833333336 | 9.75 |
| 44997.53125 | 10.68 |
| 44997.541666666664 | 9.4 |
| 44997.552083333336 | 7.66 |
| 44997.5625 | 6.6 |
| 44997.572916666664 | 7.92 |
| 44997.583333333336 | 6.2 |
| 44997.59375 | 6.33 |
| 44997.604166666664 | 6.75 |
| 44997.614583333336 | 5.95 |
| 44997.625 | 9.34 |
| 44997.635416666664 | 5.46 |
| 44997.645833333336 | 7.39 |
| 44997.65625 | 5.5 |
| 44997.666666666664 | 5.29 |
| 44997.677083333336 | 5.53 |
| 44997.6875 | 6.54 |
| 44997.697916666664 | 6.84 |
| 44997.708333333336 | 6.41 |
| 44997.71875 | 5.19 |
| 44997.729166666664 | 5.01 |
| 44997.739583333336 | 4.94 |
| 44997.75 | 4.85 |
| 44997.760416666664 | 4.71 |
| 44997.770833333336 | 4.85 |
| 44997.78125 | 5.1 |
| 44997.791666666664 | 5.05 |
| 44997.802083333336 | 5.27 |
| 44997.8125 | 5.08 |
| 44997.822916666664 | 5.41 |
| 44997.833333333336 | 5.22 |
| 44997.84375 | 5.48 |
| 44997.854166666664 | 5.33 |
| 44997.864583333336 | 5.26 |
| 44997.875 | 5.49 |
| 44997.885416666664 | 5.46 |
| 44997.895833333336 | 5.63 |
| 44997.90625 | 6.13 |
| 44997.916666666664 | 6.51 |
| 44997.927083333336 | 6.69 |
| 44997.9375 | 6.78 |
| 44997.947916666664 | 6.86 |
| 44997.958333333336 | 6.49 |
| 44997.96875 | 6.6 |
| 44997.979166666664 | 6.04 |
| 44997.989583333336 | 6.06 |
| 44998.0 | 6.14 |
| 44998.010416666664 | 6.18 |
| 44998.020833333336 | 5.86 |
| 44998.03125 | 6.1 |
| 44998.041666666664 | 5.23 |
| 44998.052083333336 | 5.17 |
| 44998.0625 | 4.95 |
| 44998.072916666664 | 4.89 |
| 44998.083333333336 | 4.9 |
| 44998.09375 | 4.63 |
| 44998.104166666664 | 4.73 |
| 44998.114583333336 | 4.51 |
| 44998.125 | 4.39 |
| 44998.135416666664 | 4.43 |
| 44998.145833333336 | 4.28 |
| 44998.15625 | 4.39 |
| 44998.166666666664 | 4.31 |
| 44998.177083333336 | 4.41 |
| 44998.1875 | 4.25 |
| 44998.197916666664 | 4.44 |
| 44998.208333333336 | 4.38 |
| 44998.21875 | 4.65 |
| 44998.229166666664 | 4.88 |
| 44998.239583333336 | 4.81 |
| 44998.25 | 4.48 |
| 44998.260416666664 | 4.48 |
| 44998.270833333336 | 4.23 |
| 44998.28125 | 4.15 |
| 44998.291666666664 | 4.14 |
| 44998.302083333336 | 4.31 |
| 44998.3125 | 4.29 |
| 44998.322916666664 | 4.31 |
| 44998.333333333336 | 4.31 |
| 44998.34375 | 4.46 |
| 44998.354166666664 | 4.88 |
| 44998.364583333336 | 4.66 |
| 44998.375 | 4.85 |
| 44998.385416666664 | 5.35 |
| 44998.395833333336 | 5.41 |
| 44998.40625 | 5.41 |
| 44998.416666666664 | 5.84 |
| 44998.427083333336 | 5.63 |
| 44998.4375 | 5.66 |
| 44998.447916666664 | 5.85 |
| 44998.458333333336 | 6.5 |
| 44998.46875 | 5.87 |
| 44998.479166666664 | 6.38 |
| 44998.489583333336 | 11.18 |
| 44998.5 | 6.15 |
| 44998.510416666664 | 5.97 |
| 44998.520833333336 | 5.95 |
| 44998.53125 | 5.62 |
| 44998.541666666664 | 5.77 |
| 44998.552083333336 | 5.94 |
| 44998.5625 | 5.99 |
| 44998.572916666664 | 5.73 |
| 44998.583333333336 | 5.42 |
| 44998.59375 | 8.37 |
| 44998.604166666664 | 4.99 |
| 44998.614583333336 | 5.06 |
| 44998.625 | 5.02 |
| 44998.635416666664 | 5.4 |
| 44998.645833333336 | 5.02 |
| 44998.65625 | 4.89 |
| 44998.666666666664 | 4.69 |
| 44998.677083333336 | 4.49 |
| 44998.6875 | 4.41 |
| 44998.697916666664 | 4.47 |
| 44998.708333333336 | 4.38 |
| 44998.71875 | 4.29 |
| 44998.729166666664 | 4.23 |
| 44998.739583333336 | 4.17 |
| 44998.75 | 4.49 |
| 44998.760416666664 | 4.25 |
| 44998.770833333336 | 4.31 |
| 44998.78125 | 4.3 |
| 44998.791666666664 | 4.39 |
| 44998.802083333336 | 4.35 |
| 44998.8125 | 4.4 |
| 44998.822916666664 | 4.39 |
| 44998.833333333336 | 4.37 |
| 44998.84375 | 4.53 |
| 44998.854166666664 | 4.53 |
| 44998.864583333336 | 4.64 |
| 44998.875 | 4.69 |
| 44998.885416666664 | 5.04 |
| 44998.895833333336 | 5.34 |
| 44998.90625 | 5.01 |
| 44998.916666666664 | 5.91 |
| 44998.927083333336 | 5.71 |
| 44998.9375 | 5.81 |
| 44998.947916666664 | 5.88 |
| 44998.958333333336 | 6.14 |
| 44998.96875 | 6.64 |
| 44998.979166666664 | 6.68 |
| 44998.989583333336 | 7.59 |
| 44999.0 | 7.23 |
| 44999.010416666664 | 7.33 |
| 44999.020833333336 | 6.62 |
| 44999.03125 | 6.54 |
| 44999.041666666664 | 6.52 |
| 44999.052083333336 | 6.42 |
| 44999.0625 | 6.19 |
| 44999.072916666664 | 5.52 |
| 44999.083333333336 | 5.48 |
| 44999.09375 | 4.95 |
| 44999.104166666664 | 4.85 |
| 44999.114583333336 | 4.92 |
| 44999.125 | 5.71 |
| 44999.135416666664 | 5.05 |
| 44999.145833333336 | 4.6 |
| 44999.15625 | 5.66 |
| 44999.166666666664 | 9.87 |
| 44999.177083333336 | 7.02 |
| 44999.1875 | 59.35 |
| 44999.197916666664 | 34.47 |
| 44999.208333333336 | 32.06 |
| 44999.21875 | 16.42 |
| 44999.229166666664 | 25.35 |
| 44999.239583333336 | 34.68 |
| 44999.25 | 25.39 |
| 44999.260416666664 | 36.04 |
| 44999.270833333336 | 4.04 |
| 44999.28125 | 4.31 |
| 44999.291666666664 | 4.34 |
| 44999.302083333336 | 4.14 |
| 44999.3125 | 4.04 |
| 44999.322916666664 | 4 |
| 44999.333333333336 | 4.41 |
| 44999.34375 | 4.39 |
| 44999.354166666664 | 4.65 |
| 44999.364583333336 | 4.55 |
| 44999.375 | 4.2 |
| 44999.385416666664 | 4.57 |
| 44999.395833333336 | 5.06 |
| 44999.40625 | 5.48 |
| 44999.416666666664 | 5.59 |
| 44999.427083333336 | 5.95 |
| 44999.4375 | 6.59 |
| 44999.447916666664 | 7.31 |
| 44999.458333333336 | 7.07 |
| 44999.46875 | 7.87 |
| 44999.479166666664 | 7.73 |
| 44999.489583333336 | 8.35 |
| 44999.5 | 9.66 |
| 44999.510416666664 | 10 |
| 44999.520833333336 | 9.39 |
| 44999.53125 | 10.01 |
| 44999.541666666664 | 17.25 |
| 44999.552083333336 | 8.82 |
| 44999.5625 | 12.35 |
| 44999.572916666664 | 8.73 |
| 44999.583333333336 | 8.43 |
| 44999.59375 | 8.52 |
| 44999.604166666664 | 10.51 |
| 44999.614583333336 | 11.38 |
| 44999.625 | 7.93 |
| 44999.635416666664 | 8.77 |
| 44999.645833333336 | 8.95 |
| 44999.65625 | 8.33 |
| 44999.666666666664 | 8.38 |
| 44999.677083333336 | 9.06 |
| 44999.6875 | 9.4 |
| 44999.697916666664 | 10.22 |
| 44999.708333333336 | 12.59 |
| 44999.71875 | 14.63 |
| 44999.729166666664 | 12.17 |
| 44999.739583333336 | 15.99 |
| 44999.75 | 18.37 |
| 44999.760416666664 | 14.72 |
| 44999.770833333336 | 15.22 |
| 44999.78125 | 10.74 |
| 44999.791666666664 | 10.31 |
| 44999.802083333336 | 9.99 |
| 44999.8125 | 10.93 |
| 44999.822916666664 | 11.9 |
| 44999.833333333336 | 13.43 |
| 44999.84375 | 12.42 |
| 44999.854166666664 | 12.83 |
| 44999.864583333336 | 13 |
| 44999.875 | 13.34 |
| 44999.885416666664 | 13.43 |
| 44999.895833333336 | 12.82 |
| 44999.90625 | 10.96 |
| 44999.916666666664 | 11.35 |
| 44999.927083333336 | 10.97 |
| 44999.9375 | 11.7 |
| 44999.947916666664 | 13.41 |
| 44999.958333333336 | 14.46 |
| 44999.96875 | 15.1 |
| 44999.979166666664 | 15.34 |
| 44999.989583333336 | 15.64 |
| 45000.0 | 15.48 |
| 45000.010416666664 | 15.85 |
| 45000.020833333336 | 15.96 |
| 45000.03125 | 15.2 |
| 45000.041666666664 | 13.79 |
| 45000.052083333336 | 13.87 |
| 45000.0625 | 12.27 |
| 45000.072916666664 | 12.23 |
| 45000.083333333336 | 11.68 |
| 45000.09375 | 11.43 |
| 45000.104166666664 | 10.93 |
| 45000.114583333336 | 16.77 |
| 45000.125 | 22.94 |
| 45000.135416666664 | 28.02 |
| 45000.145833333336 | 27.13 |
| 45000.15625 | 25.93 |
| 45000.166666666664 | 26.27 |
| 45000.177083333336 | 30.28 |
| 45000.1875 | 26.18 |
| 45000.197916666664 | 29.44 |
| 45000.208333333336 | 29.03 |
| 45000.21875 | 31.78 |
| 45000.229166666664 | 32.94 |
| 45000.239583333336 | 35.58 |
| 45000.25 | 44.63 |
| 45000.260416666664 | 38.4 |
| 45000.270833333336 | 37.39 |
| 45000.28125 | 29 |
| 45000.291666666664 | 27.03 |
| 45000.302083333336 | 19.04 |
| 45000.3125 | 17.93 |
| 45000.322916666664 | 19.75 |
| 45000.333333333336 | 17.95 |
| 45000.34375 | 17.04 |
| 45000.354166666664 | 14.95 |
| 45000.364583333336 | 14.37 |
| 45000.375 | 14.11 |
| 45000.385416666664 | 19.48 |
| 45000.395833333336 | 19.24 |
| 45000.40625 | 18.23 |
| 45000.416666666664 | 20.69 |
| 45000.427083333336 | 19.82 |
| 45000.4375 | 21.44 |
| 45000.447916666664 | 20.74 |
| 45000.458333333336 | 19.73 |
| 45000.46875 | 21.34 |
| 45000.479166666664 | 23.56 |
| 45000.489583333336 | 23.57 |
| 45000.5 | 22.95 |
| 45000.510416666664 | 26.07 |
| 45000.520833333336 | 23.56 |
| 45000.53125 | 22.5 |
| 45000.541666666664 | 22.71 |
| 45000.552083333336 | 23.32 |
| 45000.5625 | 22.3 |
| 45000.572916666664 | 22.36 |
| 45000.583333333336 | 22.72 |
| 45000.59375 | 19.53 |
| 45000.604166666664 | 18.72 |
| 45000.614583333336 | 18.24 |
| 45000.625 | 19.28 |
| 45000.635416666664 | 18.07 |
| 45000.645833333336 | 20.1 |
| 45000.65625 | 28.23 |
| 45000.666666666664 | 36.73 |
| 45000.677083333336 | 33.39 |
| 45000.6875 | 36.13 |
| 45000.697916666664 | 40.59 |
| 45000.708333333336 | 40.24 |
| 45000.71875 | 38.76 |
| 45000.729166666664 | 37.43 |
| 45000.739583333336 | 38.17 |
| 45000.75 | 39.61 |
| 45000.760416666664 | 39.54 |
| 45000.770833333336 | 39.77 |
| 45000.78125 | 38.77 |
| 45000.791666666664 | 38.25 |
| 45000.802083333336 | 35.6 |
| 45000.8125 | 61.68 |
| 45000.822916666664 | 21.4 |
| 45000.833333333336 | 18.55 |
| 45000.84375 | 19.49 |
| 45000.854166666664 | 15.01 |
| 45000.864583333336 | 20.5 |
| 45000.875 | 17.29 |
| 45000.885416666664 | 16.91 |
| 45000.895833333336 | 18.69 |
| 45000.90625 | 17.84 |
| 45000.916666666664 | 15.58 |
| 45000.927083333336 | 15.27 |
| 45000.9375 | 19.25 |
| 45000.947916666664 | 17.99 |
| 45000.958333333336 | 14.41 |
| 45000.96875 | 13.42 |
| 45000.979166666664 | 14.22 |
| 45000.989583333336 | 13.36 |
| 45001.0 | 13.03 |
| 45001.010416666664 | 12.75 |
| 45001.020833333336 | 12.19 |
| 45001.03125 | 11.65 |
| 45001.041666666664 | 11.8 |
| 45001.052083333336 | 11.12 |
| 45001.0625 | 10.85 |
| 45001.072916666664 | 10.24 |
| 45001.083333333336 | 10.15 |
| 45001.09375 | 10.91 |
| 45001.104166666664 | 11.94 |
| 45001.114583333336 | 10.72 |
| 45001.125 | 10.59 |
| 45001.135416666664 | 11.01 |
| 45001.145833333336 | 12.29 |
| 45001.15625 | 13.99 |
| 45001.166666666664 | 16.57 |
| 45001.177083333336 | 14.3 |
| 45001.1875 | 17.51 |
| 45001.197916666664 | 14.85 |
| 45001.208333333336 | 14.77 |
| 45001.21875 | 16.64 |
| 45001.229166666664 | 14.47 |
| 45001.239583333336 | 14.75 |
| 45001.25 | 14.76 |
| 45001.260416666664 | 15.27 |
| 45001.270833333336 | 15.1 |
| 45001.28125 | 15.34 |
| 45001.291666666664 | 19.95 |
| 45001.302083333336 | 16.28 |
| 45001.3125 | 32.28 |
| 45001.322916666664 | 15.33 |
| 45001.333333333336 | 15.82 |
| 45001.34375 | 16.17 |
| 45001.354166666664 | 15.63 |
| 45001.364583333336 | 11.34 |
| 45001.375 | 10.04 |
| 45001.385416666664 | 10.65 |
| 45001.395833333336 | 9.53 |
| 45001.40625 | 9.16 |
| 45001.416666666664 | 9.61 |
| 45001.427083333336 | 9.8 |
| 45001.4375 | 8.4 |
| 45001.447916666664 | 9 |
| 45001.458333333336 | 9.23 |
| 45001.46875 | 8.87 |
| 45001.479166666664 | 8.67 |
| 45001.489583333336 | 10.15 |
| 45001.5 | 11.67 |
| 45001.510416666664 | 14.04 |
| 45001.520833333336 | 12.87 |
| 45001.53125 | 12.29 |
| 45001.541666666664 | 13.47 |
| 45001.552083333336 | 13.03 |
| 45001.5625 | 12.35 |
| 45001.572916666664 | 11.62 |
| 45001.583333333336 | 11.4 |
| 45001.59375 | 10.52 |
| 45001.604166666664 | 10.78 |
| 45001.614583333336 | 10.74 |
| 45001.625 | 9.91 |
| 45001.635416666664 | 11.99 |
| 45001.645833333336 | 11.1 |
| 45001.65625 | 11.54 |
| 45001.666666666664 | 11.41 |
| 45001.677083333336 | 10.14 |
| 45001.6875 | 10.28 |
| 45001.697916666664 | 9.99 |
| 45001.708333333336 | 8.33 |
| 45001.71875 | 9.02 |
| 45001.729166666664 | 9.11 |
| 45001.739583333336 | 9.07 |
| 45001.75 | 8.82 |
| 45001.760416666664 | 8.5 |
| 45001.770833333336 | 8.29 |
| 45001.78125 | 8.69 |
| 45001.791666666664 | 8.03 |
| 45001.802083333336 | 7.32 |
| 45001.8125 | 7.21 |
| 45001.822916666664 | 6.98 |
| 45001.833333333336 | 6.87 |
| 45001.84375 | 6.49 |
| 45001.854166666664 | 6.33 |
| 45001.864583333336 | 6.3 |
| 45001.875 | 6.2 |
| 45001.885416666664 | 6.07 |
| 45001.895833333336 | 5.85 |
| 45001.90625 | 5.93 |
| 45001.916666666664 | 6 |
| 45001.927083333336 | 6.15 |
| 45001.9375 | 6.19 |
| 45001.947916666664 | 6.21 |
| 45001.958333333336 | 6.3 |
| 45001.96875 | 6.33 |
| 45001.979166666664 | 6.59 |
| 45001.989583333336 | 7.04 |
| 45002.0 | 6.97 |
| 45002.010416666664 | 7.53 |
| 45002.020833333336 | 8.14 |
| 45002.03125 | 8.81 |
| 45002.041666666664 | 9.89 |
| 45002.052083333336 | 10.19 |
| 45002.0625 | 9.96 |
| 45002.072916666664 | 10.07 |
| 45002.083333333336 | 10.02 |
| 45002.09375 | 9.36 |
| 45002.104166666664 | 9.23 |
| 45002.114583333336 | 8.95 |
| 45002.125 | 8.72 |
| 45002.135416666664 | 8.45 |
| 45002.145833333336 | 8.26 |
| 45002.15625 | 8.6 |
| 45002.166666666664 | 8.66 |
| 45002.177083333336 | 9.05 |
| 45002.1875 | 8.73 |
| 45002.197916666664 | 9.16 |
| 45002.208333333336 | 9.87 |
| 45002.21875 | 9.79 |
| 45002.229166666664 | 9.42 |
| 45002.239583333336 | 8.83 |
| 45002.25 | 8.64 |
| 45002.260416666664 | 8.38 |
| 45002.270833333336 | 8.16 |
| 45002.28125 | 10.19 |
| 45002.291666666664 | 8.71 |
| 45002.302083333336 | 10.39 |
| 45002.3125 | 8.6 |
| 45002.322916666664 | 8.94 |
| 45002.333333333336 | 10.97 |
| 45002.34375 | 9.23 |
| 45002.354166666664 | 9.81 |
| 45002.364583333336 | 10.28 |
| 45002.375 | 9.93 |
| 45002.385416666664 | 11.64 |
| 45002.395833333336 | 7.97 |
| 45002.40625 | 6.61 |
| 45002.416666666664 | 5.55 |
| 45002.427083333336 | 5.69 |
| 45002.4375 | 5.32 |
| 45002.447916666664 | 5.65 |
| 45002.458333333336 | 5.67 |
| 45002.46875 | 5.83 |
| 45002.479166666664 | 6.17 |
| 45002.489583333336 | 5.37 |
| 45002.5 | 6.27 |
| 45002.510416666664 | 7.14 |
| 45002.520833333336 | 7.22 |
| 45002.53125 | 7.6 |
| 45002.541666666664 | 9.13 |
| 45002.552083333336 | 9.67 |
| 45002.5625 | 10.06 |
| 45002.572916666664 | 9.65 |
| 45002.583333333336 | 10.5 |
| 45002.59375 | 10.54 |
| 45002.604166666664 | 11.08 |
| 45002.614583333336 | 11.09 |
| 45002.625 | 11.08 |
| 45002.635416666664 | 10.39 |
| 45002.645833333336 | 10 |
| 45002.65625 | 9.6 |
| 45002.666666666664 | 9.24 |
| 45002.677083333336 | 8.67 |
| 45002.6875 | 9.1 |
| 45002.697916666664 | 9.6 |
| 45002.708333333336 | 9.18 |
| 45002.71875 | 11.2 |
| 45002.729166666664 | 11 |
| 45002.739583333336 | 12.25 |
| 45002.75 | 12.65 |
| 45002.760416666664 | 12 |
| 45002.770833333336 | 11.75 |
| 45002.78125 | 11.89 |
| 45002.791666666664 | 12.05 |
| 45002.802083333336 | 16.1 |
| 45002.8125 | 11.97 |
| 45002.822916666664 | 12.02 |
| 45002.833333333336 | 10.77 |
| 45002.84375 | 11.1 |
| 45002.854166666664 | 10.19 |
| 45002.864583333336 | 9.59 |
| 45002.875 | 8.29 |
| 45002.885416666664 | 8.17 |
| 45002.895833333336 | 8.5 |
| 45002.90625 | 8.67 |
| 45002.916666666664 | 8.18 |
| 45002.927083333336 | 6.93 |
| 45002.9375 | 6.88 |
| 45002.947916666664 | 6.83 |
| 45002.958333333336 | 6.63 |
| 45002.96875 | 6.63 |
| 45002.979166666664 | 6.56 |
| 45002.989583333336 | 6.78 |
| 45003.0 | 7.05 |
| 45003.010416666664 | 7.23 |
| 45003.020833333336 | 7.57 |
| 45003.03125 | 8.16 |
| 45003.041666666664 | 8.07 |
| 45003.052083333336 | 8.48 |
| 45003.0625 | 9.85 |
| 45003.072916666664 | 9.91 |
| 45003.083333333336 | 10.35 |
| 45003.09375 | 9.98 |
| 45003.104166666664 | 10.25 |
| 45003.114583333336 | 10.15 |
| 45003.125 | 9.6 |
| 45003.135416666664 | 9.18 |
| 45003.145833333336 | 9.87 |
| 45003.15625 | 8.93 |
| 45003.166666666664 | 8.45 |
| 45003.177083333336 | 8.3 |
| 45003.1875 | 8.38 |
| 45003.197916666664 | 8.74 |
| 45003.208333333336 | 8.38 |
| 45003.21875 | 8.66 |
| 45003.229166666664 | 8.74 |
| 45003.239583333336 | 8.88 |
| 45003.25 | 9.53 |
| 45003.260416666664 | 9.6 |
| 45003.270833333336 | 8.63 |
| 45003.28125 | 9.31 |
| 45003.291666666664 | 8.58 |
| 45003.302083333336 | 8.36 |
| 45003.3125 | 8.96 |
| 45003.322916666664 | 9.36 |
| 45003.333333333336 | 9.16 |
| 45003.34375 | 9.74 |
| 45003.354166666664 | 8.28 |
| 45003.364583333336 | 7.84 |
| 45003.375 | 7.96 |
| 45003.385416666664 | 7.52 |
| 45003.395833333336 | 7.66 |
| 45003.40625 | 7.61 |
| 45003.416666666664 | 6.83 |
| 45003.427083333336 | 7.05 |
| 45003.4375 | 7.26 |
| 45003.447916666664 | 7.48 |
| 45003.458333333336 | 6.52 |
| 45003.46875 | 5.92 |
| 45003.479166666664 | 5.98 |
| 45003.489583333336 | 6.2 |
| 45003.5 | 6.13 |
| 45003.510416666664 | 6.39 |
| 45003.520833333336 | 7.49 |
| 45003.53125 | 7.65 |
| 45003.541666666664 | 7.79 |
| 45003.552083333336 | 9.74 |
| 45003.5625 | 10.77 |
| 45003.572916666664 | 11.1 |
| 45003.583333333336 | 13.93 |
| 45003.59375 | 20.53 |
| 45003.604166666664 | 11.94 |
| 45003.614583333336 | 37.75 |
| 45003.625 | 24.35 |
| 45003.635416666664 | 15.95 |
| 45003.645833333336 | 14.74 |
| 45003.65625 | 20.16 |
| 45003.666666666664 | 18.2 |
| 45003.677083333336 | 39.91 |
| 45003.6875 | 20.36 |
| 45003.697916666664 | 15.39 |
| 45003.708333333336 | 9.47 |
| 45003.71875 | 9.19 |
| 45003.729166666664 | 9.11 |
| 45003.739583333336 | 9.36 |
| 45003.75 | 9.23 |
| 45003.760416666664 | 8.99 |
| 45003.770833333336 | 10.48 |
| 45003.78125 | 10.12 |
| 45003.791666666664 | 9.58 |
| 45003.802083333336 | 9.28 |
| 45003.8125 | 8.67 |
| 45003.822916666664 | 8.28 |
| 45003.833333333336 | 8.64 |
| 45003.84375 | 7.5 |
| 45003.854166666664 | 7.37 |
| 45003.864583333336 | 7.16 |
| 45003.875 | 7.1 |
| 45003.885416666664 | 6.9 |
| 45003.895833333336 | 7.28 |
| 45003.90625 | 9.08 |
| 45003.916666666664 | 8.63 |
| 45003.927083333336 | 8.11 |
| 45003.9375 | 7.92 |
| 45003.947916666664 | 11.25 |
| 45003.958333333336 | 10.91 |
| 45003.96875 | 9.96 |
| 45003.979166666664 | 5.88 |
| 45003.989583333336 | 5.76 |
| 45004.0 | 5.76 |
| 45004.010416666664 | 5.6 |
| 45004.020833333336 | 5.6 |
| 45004.03125 | 6.23 |
| 45004.041666666664 | 6.42 |
| 45004.052083333336 | 8.27 |
| 45004.0625 | 7.8 |
| 45004.072916666664 | 7.56 |
| 45004.083333333336 | 8.44 |
| 45004.09375 | 9.97 |
| 45004.104166666664 | 10.39 |
| 45004.114583333336 | 12.17 |
| 45004.125 | 13.94 |
| 45004.135416666664 | 13.33 |
| 45004.145833333336 | 15.31 |
| 45004.15625 | 14.98 |
| 45004.166666666664 | 15.86 |
| 45004.177083333336 | 13.91 |
| 45004.1875 | 13.35 |
| 45004.197916666664 | 12.04 |
| 45004.208333333336 | 10.92 |
| 45004.21875 | 9.86 |
| 45004.229166666664 | 9.74 |
| 45004.239583333336 | 9.75 |
| 45004.25 | 10.28 |
| 45004.260416666664 | 10.01 |
| 45004.270833333336 | 9.77 |
| 45004.28125 | 9.74 |
| 45004.291666666664 | 10.28 |
| 45004.302083333336 | 10.12 |
| 45004.3125 | 10.08 |
| 45004.322916666664 | 9.2 |
| 45004.333333333336 | 8.65 |
| 45004.34375 | 8.83 |
| 45004.354166666664 | 8.29 |
| 45004.364583333336 | 8.36 |
| 45004.375 | 8.69 |
| 45004.385416666664 | 8.33 |
| 45004.395833333336 | 8.83 |
| 45004.40625 | 9.23 |
| 45004.416666666664 | 10.93 |
| 45004.427083333336 | 8.56 |
| 45004.4375 | 8.91 |
| 45004.447916666664 | 7.33 |
| 45004.458333333336 | 7.42 |
| 45004.46875 | 7.36 |
| 45004.479166666664 | 8.07 |
| 45004.489583333336 | 7.83 |
| 45004.5 | 6.45 |
| 45004.510416666664 | 6.47 |
| 45004.520833333336 | 6.32 |
| 45004.53125 | 5.88 |
| 45004.541666666664 | 5.94 |
| 45004.552083333336 | 6.85 |
| 45004.5625 | 6.6 |
| 45004.572916666664 | 6.35 |
| 45004.583333333336 | 6.95 |
| 45004.59375 | 7.95 |
| 45004.604166666664 | 6.69 |
| 45004.614583333336 | 11.64 |
| 45004.625 | 10.72 |
| 45004.635416666664 | 12.33 |
| 45004.645833333336 | 14.61 |
| 45004.65625 | 14.9 |
| 45004.666666666664 | 17.99 |
| 45004.677083333336 | 18.54 |
| 45004.6875 | 13.25 |
| 45004.697916666664 | 17.93 |
| 45004.708333333336 | 16.3 |
| 45004.71875 | 14.98 |
| 45004.729166666664 | 14.16 |
| 45004.739583333336 | 13.86 |
| 45004.75 | 32.11 |
| 45004.760416666664 | 11.68 |
| 45004.770833333336 | 12.13 |
| 45004.78125 | 11.81 |
| 45004.791666666664 | 17.92 |
| 45004.802083333336 | 14.25 |
| 45004.8125 | 12.47 |
| 45004.822916666664 | 12.49 |
| 45004.833333333336 | 27.84 |
| 45004.84375 | 11.82 |
| 45004.854166666664 | 11.18 |
| 45004.864583333336 | 10.73 |
| 45004.875 | 10.62 |
| 45004.885416666664 | 10.58 |
| 45004.895833333336 | 11.03 |
| 45004.90625 | 12.78 |
| 45004.916666666664 | 10.63 |
| 45004.927083333336 | 12.86 |
| 45004.9375 | 12.74 |
| 45004.947916666664 | 12.73 |
| 45004.958333333336 | 12.06 |
| 45004.96875 | 10.18 |
| 45004.979166666664 | 11.03 |
| 45004.989583333336 | 11.71 |
| 45005.0 | 8.93 |
| 45005.010416666664 | 7.07 |
| 45005.020833333336 | 7.19 |
| 45005.03125 | 7.23 |
| 45005.041666666664 | 6.88 |
| 45005.052083333336 | 7.04 |
| 45005.0625 | 7.57 |
| 45005.072916666664 | 6.74 |
| 45005.083333333336 | 6.97 |
| 45005.09375 | 7.61 |
| 45005.104166666664 | 7.48 |
| 45005.114583333336 | 10.51 |
| 45005.125 | 11.67 |
| 45005.135416666664 | 11.63 |
| 45005.145833333336 | 14.11 |
| 45005.15625 | 15.6 |
| 45005.166666666664 | 14.65 |
| 45005.177083333336 | 14.49 |
| 45005.1875 | 15.75 |
| 45005.197916666664 | 13.99 |
| 45005.208333333336 | 14.49 |
| 45005.21875 | 13.1 |
| 45005.229166666664 | 13.26 |
| 45005.239583333336 | 11.98 |
| 45005.25 | 10.48 |
| 45005.260416666664 | 10.5 |
| 45005.270833333336 | 10.32 |
| 45005.28125 | 11.58 |
| 45005.291666666664 | 10.93 |
| 45005.302083333336 | 10.64 |
| 45005.3125 | 11.7 |
| 45005.322916666664 | 11.75 |
| 45005.333333333336 | 11.32 |
| 45005.34375 | 11.11 |
| 45005.354166666664 | 9.66 |
| 45005.364583333336 | 8.36 |
| 45005.375 | 23.88 |
| 45005.385416666664 | 9.25 |
| 45005.395833333336 | 10.59 |
| 45005.40625 | 8.44 |
| 45005.416666666664 | 9.28 |
| 45005.427083333336 | 10.08 |
| 45005.4375 | 9.99 |
| 45005.447916666664 | 9.61 |
| 45005.458333333336 | 9.03 |
| 45005.46875 | 9.47 |
| 45005.479166666664 | 9.06 |
| 45005.489583333336 | 11.82 |
| 45005.5 | 9.29 |
| 45005.510416666664 | 9.15 |
| 45005.520833333336 | 8.1 |
| 45005.53125 | 6.43 |
| 45005.541666666664 | 6.37 |
| 45005.552083333336 | 6.4 |
| 45005.5625 | 6.46 |
| 45005.572916666664 | 6.35 |
| 45005.583333333336 | 6.35 |
| 45005.59375 | 6 |
| 45005.604166666664 | 6.06 |
| 45005.614583333336 | 6.42 |
| 45005.625 | 6.85 |
| 45005.635416666664 | 6.28 |
| 45005.645833333336 | 6.95 |
| 45005.65625 | 9.43 |
| 45005.666666666664 | 10.23 |
| 45005.677083333336 | 10.53 |
| 45005.6875 | 14.03 |
| 45005.697916666664 | 15.02 |
| 45005.708333333336 | 16.15 |
| 45005.71875 | 15.64 |
| 45005.729166666664 | 14.69 |
| 45005.739583333336 | 16.35 |
| 45005.75 | 16.5 |
| 45005.760416666664 | 16.2 |
| 45005.770833333336 | 20.05 |
| 45005.78125 | 13.19 |
| 45005.791666666664 | 10.93 |
| 45005.802083333336 | 10.46 |
| 45005.8125 | 10.77 |
| 45005.822916666664 | 11.09 |
| 45005.833333333336 | 9.83 |
| 45005.84375 | 9.94 |
| 45005.854166666664 | 9.38 |
| 45005.864583333336 | 8.5 |
| 45005.875 | 8.18 |
| 45005.885416666664 | 6.95 |
| 45005.895833333336 | 6.43 |
| 45005.90625 | 6.32 |
| 45005.916666666664 | 6.4 |
| 45005.927083333336 | 6.58 |
| 45005.9375 | 6.58 |
| 45005.947916666664 | 6.93 |
| 45005.958333333336 | 7.53 |
| 45005.96875 | 6.81 |
| 45005.979166666664 | 6.64 |
| 45005.989583333336 | 6.7 |
| 45006.0 | 6.49 |
| 45006.010416666664 | 6.08 |
| 45006.020833333336 | 5.58 |
| 45006.03125 | 5.65 |
| 45006.041666666664 | 5.8 |
| 45006.052083333336 | 5.7 |
| 45006.0625 | 5.23 |
| 45006.072916666664 | 5.29 |
| 45006.083333333336 | 5.22 |
| 45006.09375 | 5.8 |
| 45006.104166666664 | 7.26 |
| 45006.114583333336 | 6.02 |
| 45006.125 | 7.87 |
| 45006.135416666664 | 8.37 |
| 45006.145833333336 | 8.93 |
| 45006.15625 | 10.38 |
| 45006.166666666664 | 12.9 |
| 45006.177083333336 | 12.18 |
| 45006.1875 | 14.56 |
| 45006.197916666664 | 15.32 |
| 45006.208333333336 | 15.1 |
| 45006.21875 | 12.42 |
| 45006.229166666664 | 14.25 |
| 45006.239583333336 | 13.4 |
| 45006.25 | 14.47 |
| 45006.260416666664 | 13.55 |
| 45006.270833333336 | 13.25 |
| 45006.28125 | 11.57 |
| 45006.291666666664 | 13.2 |
| 45006.302083333336 | 10.59 |
| 45006.3125 | 10.38 |
| 45006.322916666664 | 10.34 |
| 45006.333333333336 | 10.49 |
| 45006.34375 | 10.6 |
| 45006.354166666664 | 10.77 |
| 45006.364583333336 | 11.92 |
| 45006.375 | 13.21 |
| 45006.385416666664 | 12.03 |
| 45006.395833333336 | 9.91 |
| 45006.40625 | 9.03 |
| 45006.416666666664 | 7.81 |
| 45006.427083333336 | 7.44 |
| 45006.4375 | 7.76 |
| 45006.447916666664 | 7.93 |
| 45006.458333333336 | 8.45 |
| 45006.46875 | 9.3 |
| 45006.479166666664 | 9.09 |
| 45006.489583333336 | 9.48 |
| 45006.5 | 7.97 |
| 45006.510416666664 | 7.45 |
| 45006.520833333336 | 79.72 |
| 45006.53125 | 16.54 |
| 45006.541666666664 | 18.83 |
| 45006.552083333336 | 12.94 |
| 45006.5625 | 7.63 |
| 45006.572916666664 | 6.35 |
| 45006.583333333336 | 6.2 |
| 45006.59375 | 5.85 |
| 45006.604166666664 | 5.6 |
| 45006.614583333336 | 5.65 |
| 45006.625 | 7.41 |
| 45006.635416666664 | 7.31 |
| 45006.645833333336 | 7.99 |
| 45006.65625 | 8.86 |
| 45006.666666666664 | 9.48 |
| 45006.677083333336 | 11.26 |
| 45006.6875 | 11.17 |
| 45006.697916666664 | 11.75 |
| 45006.708333333336 | 13.52 |
| 45006.71875 | 14.84 |
| 45006.729166666664 | 14.74 |
| 45006.739583333336 | 12.9 |
| 45006.75 | 13.09 |
| 45006.760416666664 | 12.6 |
| 45006.770833333336 | 13.12 |
| 45006.78125 | 12.74 |
| 45006.791666666664 | 11.61 |
| 45006.802083333336 | 12.43 |
| 45006.8125 | 11.86 |
| 45006.822916666664 | 10.79 |
| 45006.833333333336 | 11.1 |
| 45006.84375 | 12.92 |
| 45006.854166666664 | 12.23 |
| 45006.864583333336 | 11.23 |
| 45006.875 | 10.33 |
| 45006.885416666664 | 9.96 |
| 45006.895833333336 | 9.97 |
| 45006.90625 | 11.22 |
| 45006.916666666664 | 17.05 |
| 45006.927083333336 | 12.39 |
| 45006.9375 | 11.77 |
| 45006.947916666664 | 13.79 |
| 45006.958333333336 | 11.9 |
| 45006.96875 | 9.78 |
| 45006.979166666664 | 10.36 |
| 45006.989583333336 | 9.83 |
| 45007.0 | 8.5 |
| 45007.010416666664 | 7.88 |
| 45007.020833333336 | 7.92 |
| 45007.03125 | 7.22 |
| 45007.041666666664 | 6.79 |
| 45007.052083333336 | 6.39 |
| 45007.0625 | 6.2 |
| 45007.072916666664 | 6.5 |
| 45007.083333333336 | 6.21 |
| 45007.09375 | 5.8 |
| 45007.104166666664 | 9.12 |
| 45007.114583333336 | 6.11 |
| 45007.125 | 6.34 |
| 45007.135416666664 | 5.6 |
| 45007.145833333336 | 7.09 |
| 45007.15625 | 6.8 |
| 45007.166666666664 | 6.6 |
| 45007.177083333336 | 9.35 |
| 45007.1875 | 10.76 |
| 45007.197916666664 | 12.15 |
| 45007.208333333336 | 14.31 |
| 45007.21875 | 15.37 |
| 45007.229166666664 | 16.42 |
| 45007.239583333336 | 17.52 |
| 45007.25 | 16.07 |
| 45007.260416666664 | 15.96 |
| 45007.270833333336 | 15.61 |
| 45007.28125 | 15.26 |
| 45007.291666666664 | 14.79 |
| 45007.302083333336 | 15.01 |
| 45007.3125 | 14.83 |
| 45007.322916666664 | 14.76 |
| 45007.333333333336 | 13.21 |
| 45007.34375 | 10.52 |
| 45007.354166666664 | 10.75 |
| 45007.364583333336 | 11.3 |
| 45007.375 | 11.35 |
| 45007.385416666664 | 11.18 |
| 45007.395833333336 | 13.54 |
| 45007.40625 | 12.9 |
| 45007.416666666664 | 11.29 |
| 45007.427083333336 | 12.32 |
| 45007.4375 | 10.47 |
| 45007.447916666664 | 9.77 |
| 45007.458333333336 | 8.36 |
| 45007.46875 | 8.41 |
| 45007.479166666664 | 8.76 |
| 45007.489583333336 | 8.86 |
| 45007.5 | 9.12 |
| 45007.510416666664 | 9.1 |
| 45007.520833333336 | 10.15 |
| 45007.53125 | 10.92 |
| 45007.541666666664 | 9.56 |
| 45007.552083333336 | 11.2 |
| 45007.5625 | 10.78 |
| 45007.572916666664 | 10.34 |
| 45007.583333333336 | 12.13 |
| 45007.59375 | 8.67 |
| 45007.604166666664 | 6.53 |
| 45007.614583333336 | 8.21 |
| 45007.625 | 6.17 |
| 45007.635416666664 | 6.71 |
| 45007.645833333336 | 6.19 |
| 45007.65625 | 7.43 |
| 45007.666666666664 | 7.96 |
| 45007.677083333336 | 8.09 |
| 45007.6875 | 8.88 |
| 45007.697916666664 | 10.07 |
| 45007.708333333336 | 12.11 |
| 45007.71875 | 12.44 |
| 45007.729166666664 | 12.63 |
| 45007.739583333336 | 13.26 |
| 45007.75 | 13.3 |
| 45007.760416666664 | 13.4 |
| 45007.770833333336 | 13.17 |
| 45007.78125 | 14.35 |
| 45007.791666666664 | 13.7 |
| 45007.802083333336 | 14.05 |
| 45007.8125 | 13.56 |
| 45007.822916666664 | 12.84 |
| 45007.833333333336 | 12.13 |
| 45007.84375 | 11.66 |
| 45007.854166666664 | 11.11 |
| 45007.864583333336 | 10.7 |
| 45007.875 | 10.99 |
| 45007.885416666664 | 10.6 |
| 45007.895833333336 | 10.42 |
| 45007.90625 | 11.44 |
| 45007.916666666664 | 9.73 |
| 45007.927083333336 | 9.09 |
| 45007.9375 | 8.44 |
| 45007.947916666664 | 8.76 |
| 45007.958333333336 | 8.71 |
| 45007.96875 | 8.46 |
| 45007.979166666664 | 8.63 |
| 45007.989583333336 | 8.4 |
| 45008.0 | 8.72 |
| 45008.010416666664 | 8.96 |
| 45008.020833333336 | 8.59 |
| 45008.03125 | 8.3 |
| 45008.041666666664 | 8.01 |
| 45008.052083333336 | 7.31 |
| 45008.0625 | 7.97 |
| 45008.072916666664 | 7.61 |
| 45008.083333333336 | 7.75 |
| 45008.09375 | 6.63 |
| 45008.104166666664 | 7.37 |
| 45008.114583333336 | 6.7 |
| 45008.125 | 6.29 |
| 45008.135416666664 | 6 |
| 45008.145833333336 | 5.63 |
| 45008.15625 | 5.7 |
| 45008.166666666664 | 5.24 |
| 45008.177083333336 | 7.14 |
| 45008.1875 | 6.62 |
| 45008.197916666664 | 6.59 |
| 45008.208333333336 | 9.16 |
| 45008.21875 | 9.89 |
| 45008.229166666664 | 8.68 |
| 45008.239583333336 | 11.9 |
| 45008.25 | 14.65 |
| 45008.260416666664 | 15.22 |
| 45008.270833333336 | 21.84 |
| 45008.28125 | 19.4 |
| 45008.291666666664 | 24.01 |
| 45008.302083333336 | 20.26 |
| 45008.3125 | 20.36 |
| 45008.322916666664 | 19.57 |
| 45008.333333333336 | 18.35 |
| 45008.34375 | 17.12 |
| 45008.354166666664 | 15.8 |
| 45008.364583333336 | 13.73 |
| 45008.375 | 13.2 |
| 45008.385416666664 | 13.24 |
| 45008.395833333336 | 13.37 |
| 45008.40625 | 13.23 |
| 45008.416666666664 | 12.04 |
| 45008.427083333336 | 15.51 |
| 45008.4375 | 13.78 |
| 45008.447916666664 | 13.81 |
| 45008.458333333336 | 16.38 |
| 45008.46875 | 13.72 |
| 45008.479166666664 | 13.86 |
| 45008.489583333336 | 14.16 |
| 45008.5 | 13.58 |
| 45008.510416666664 | 13.4 |
| 45008.520833333336 | 14.2 |
| 45008.53125 | 14.64 |
| 45008.541666666664 | 13.85 |
| 45008.552083333336 | 13.13 |
| 45008.5625 | 12.9 |
| 45008.572916666664 | 11.77 |
| 45008.583333333336 | 10.67 |
| 45008.59375 | 10.2 |
| 45008.604166666664 | 9.51 |
| 45008.614583333336 | 8.61 |
| 45008.625 | 8.32 |
| 45008.635416666664 | 10.29 |
| 45008.645833333336 | 7.44 |
| 45008.65625 | 7.19 |
| 45008.666666666664 | 7.12 |
| 45008.677083333336 | 7.47 |
| 45008.6875 | 8.42 |
| 45008.697916666664 | 9.06 |
| 45008.708333333336 | 9.37 |
| 45008.71875 | 10.72 |
| 45008.729166666664 | 11.29 |
| 45008.739583333336 | 10.95 |
| 45008.75 | 13.87 |
| 45008.760416666664 | 13.88 |
| 45008.770833333336 | 14.86 |
| 45008.78125 | 15.17 |
| 45008.791666666664 | 16.13 |
| 45008.802083333336 | 15.97 |
| 45008.8125 | 15.18 |
| 45008.822916666664 | 15.39 |
| 45008.833333333336 | 15.63 |
| 45008.84375 | 14.72 |
| 45008.854166666664 | 14.18 |
| 45008.864583333336 | 12.74 |
| 45008.875 | 12.32 |
| 45008.885416666664 | 12.25 |
| 45008.895833333336 | 12.23 |
| 45008.90625 | 11.97 |
| 45008.916666666664 | 11.91 |
| 45008.927083333336 | 13.37 |
| 45008.9375 | 15.96 |
| 45008.947916666664 | 14.08 |
| 45008.958333333336 | 13.92 |
| 45008.96875 | 14.78 |
| 45008.979166666664 | 13.94 |
| 45008.989583333336 | 13.81 |
| 45009.0 | 14.52 |
| 45009.010416666664 | 13.85 |
| 45009.020833333336 | 12.9 |
| 45009.03125 | 12.87 |
| 45009.041666666664 | 12.48 |
| 45009.052083333336 | 11.61 |
| 45009.0625 | 10.99 |
| 45009.072916666664 | 11.1 |
| 45009.083333333336 | 10.95 |
| 45009.09375 | 10.89 |
| 45009.104166666664 | 10.75 |
| 45009.114583333336 | 9.16 |
| 45009.125 | 7.94 |
| 45009.135416666664 | 8.55 |
| 45009.145833333336 | 7.88 |
| 45009.15625 | 7.38 |
| 45009.166666666664 | 7.39 |
| 45009.177083333336 | 7.55 |
| 45009.1875 | 6.75 |
| 45009.197916666664 | 7.71 |
| 45009.208333333336 | 9.36 |
| 45009.21875 | 10.09 |
| 45009.229166666664 | 11.62 |
| 45009.239583333336 | 12.29 |
| 45009.25 | 13.46 |
| 45009.260416666664 | 14.8 |
| 45009.270833333336 | 15.53 |
| 45009.28125 | 17.87 |
| 45009.291666666664 | 19.71 |
| 45009.302083333336 | 21.65 |
| 45009.3125 | 21.58 |
| 45009.322916666664 | 23.44 |
| 45009.333333333336 | 19.94 |
| 45009.34375 | 19.86 |
| 45009.354166666664 | 16.92 |
| 45009.364583333336 | 17.03 |
| 45009.375 | 16.44 |
| 45009.385416666664 | 15.2 |
| 45009.395833333336 | 13.81 |
| 45009.40625 | 12.6 |
| 45009.416666666664 | 13.75 |
| 45009.427083333336 | 36.08 |
| 45009.4375 | 16.13 |
| 45009.447916666664 | 13.74 |
| 45009.458333333336 | 17.81 |
| 45009.46875 | 16.03 |
| 45009.479166666664 | 15.39 |
| 45009.489583333336 | 15.44 |
| 45009.5 | 14.1 |
| 45009.510416666664 | 13.36 |
| 45009.520833333336 | 13.87 |
| 45009.53125 | 13.04 |
| 45009.541666666664 | 12.29 |
| 45009.552083333336 | 12.61 |
| 45009.5625 | 14.58 |
| 45009.572916666664 | 11.59 |
| 45009.583333333336 | 11.69 |
| 45009.59375 | 10.75 |
| 45009.604166666664 | 10.47 |
| 45009.614583333336 | 9.51 |
| 45009.625 | 8.86 |
| 45009.635416666664 | 8.27 |
| 45009.645833333336 | 10.06 |
| 45009.65625 | 10.31 |
| 45009.666666666664 | 8.82 |
| 45009.677083333336 | 10.66 |
| 45009.6875 | 9.43 |
| 45009.697916666664 | 10.46 |
| 45009.708333333336 | 11.59 |
| 45009.71875 | 13.84 |
| 45009.729166666664 | 14.93 |
| 45009.739583333336 | 15.81 |
| 45009.75 | 14 |
| 45009.760416666664 | 18.9 |
| 45009.770833333336 | 19.13 |
| 45009.78125 | 20.33 |
| 45009.791666666664 | 22.16 |
| 45009.802083333336 | 21.54 |
| 45009.8125 | 24.16 |
| 45009.822916666664 | 26.06 |
| 45009.833333333336 | 24.85 |
| 45009.84375 | 24.86 |
| 45009.854166666664 | 25.14 |
| 45009.864583333336 | 25.11 |
| 45009.875 | 24.1 |
| 45009.885416666664 | 20.85 |
| 45009.895833333336 | 17.38 |
| 45009.90625 | 17.79 |
| 45009.916666666664 | 15.89 |
| 45009.927083333336 | 13.28 |
| 45009.9375 | 13.47 |
| 45009.947916666664 | 13.14 |
| 45009.958333333336 | 13.25 |
| 45009.96875 | 13.49 |
| 45009.979166666664 | 13.74 |
| 45009.989583333336 | 13.75 |
| 45010.0 | 14.19 |
| 45010.010416666664 | 15.89 |
| 45010.020833333336 | 14.03 |
| 45010.03125 | 17.16 |
| 45010.041666666664 | 17.8 |
| 45010.052083333336 | 16.98 |
| 45010.0625 | 14.31 |
| 45010.072916666664 | 14.21 |
| 45010.083333333336 | 12.58 |
| 45010.09375 | 12.06 |
| 45010.104166666664 | 11.35 |
| 45010.114583333336 | 10.76 |
| 45010.125 | 10.37 |
| 45010.135416666664 | 9.59 |
| 45010.145833333336 | 9.38 |
| 45010.15625 | 9.03 |
| 45010.166666666664 | 9.55 |
| 45010.177083333336 | 8.05 |
| 45010.1875 | 7.84 |
| 45010.197916666664 | 8.03 |
| 45010.208333333336 | 8.37 |
| 45010.21875 | 8.65 |
| 45010.229166666664 | 7.57 |
| 45010.239583333336 | 8.52 |
| 45010.25 | 9.37 |
| 45010.260416666664 | 9.55 |
| 45010.270833333336 | 9.48 |
| 45010.28125 | 10.83 |
| 45010.291666666664 | 14.11 |
| 45010.302083333336 | 14.12 |
| 45010.3125 | 15.69 |
| 45010.322916666664 | 17.34 |
| 45010.333333333336 | 19.2 |
| 45010.34375 | 23.82 |
| 45010.354166666664 | 25.6 |
| 45010.364583333336 | 29.61 |
| 45010.375 | 33.59 |
| 45010.385416666664 | 29.36 |
| 45010.395833333336 | 27.72 |
| 45010.40625 | 25.08 |
| 45010.416666666664 | 22.93 |
| 45010.427083333336 | 17.92 |
| 45010.4375 | 15.63 |
| 45010.447916666664 | 14.37 |
| 45010.458333333336 | 14.53 |
| 45010.46875 | 13.73 |
| 45010.479166666664 | 13.2 |
| 45010.489583333336 | 13.03 |
| 45010.5 | 12.9 |
| 45010.510416666664 | 12.52 |
| 45010.520833333336 | 12.4 |
| 45010.53125 | 12.52 |
| 45010.541666666664 | 12.03 |
| 45010.552083333336 | 12.15 |
| 45010.5625 | 11.77 |
| 45010.572916666664 | 11.83 |
| 45010.583333333336 | 10.71 |
| 45010.59375 | 10.45 |
| 45010.604166666664 | 9.25 |
| 45010.614583333336 | 8.33 |
| 45010.625 | 8.22 |
| 45010.635416666664 | 7.65 |
| 45010.645833333336 | 7.56 |
| 45010.65625 | 6.94 |
| 45010.666666666664 | 7.06 |
| 45010.677083333336 | 8 |
| 45010.6875 | 6.64 |
| 45010.697916666664 | 6.74 |
| 45010.708333333336 | 6.5 |
| 45010.71875 | 5.97 |
| 45010.729166666664 | 6.63 |
| 45010.739583333336 | 6.8 |
| 45010.75 | 8.58 |
| 45010.760416666664 | 7.97 |
| 45010.770833333336 | 8.6 |
| 45010.78125 | 10.48 |
| 45010.791666666664 | 9.83 |
| 45010.802083333336 | 10.27 |
| 45010.8125 | 10.74 |
| 45010.822916666664 | 11.33 |
| 45010.833333333336 | 11.05 |
| 45010.84375 | 11.78 |
| 45010.854166666664 | 11.39 |
| 45010.864583333336 | 10.79 |
| 45010.875 | 10.53 |
| 45010.885416666664 | 10.79 |
| 45010.895833333336 | 10.27 |
| 45010.90625 | 10.06 |
| 45010.916666666664 | 10.07 |
| 45010.927083333336 | 9.29 |
| 45010.9375 | 8.88 |
| 45010.947916666664 | 8.98 |
| 45010.958333333336 | 9.38 |
| 45010.96875 | 9.32 |
| 45010.979166666664 | 9.19 |
| 45010.989583333336 | 9.26 |
| 45011.0 | 8.67 |
| 45011.010416666664 | 8.24 |
| 45011.020833333336 | 8.42 |
| 45011.03125 | 7.44 |
| 45011.041666666664 | 7.74 |
| 45011.052083333336 | 7.4 |
| 45011.0625 | 6.98 |
| 45011.072916666664 | 6.99 |
| 45011.083333333336 | 6.91 |
| 45011.09375 | 6.26 |
| 45011.104166666664 | 5.9 |
| 45011.114583333336 | 6.45 |
| 45011.125 | 6.98 |
| 45011.135416666664 | 6.57 |
| 45011.145833333336 | 6.82 |
| 45011.15625 | 6.06 |
| 45011.166666666664 | 6.35 |
| 45011.177083333336 | 6.04 |
| 45011.1875 | 5.74 |
| 45011.197916666664 | 5.51 |
| 45011.208333333336 | 5.93 |
| 45011.21875 | 5.22 |
| 45011.229166666664 | 5.19 |
| 45011.239583333336 | 5.29 |
| 45011.25 | 5.14 |
| 45011.260416666664 | 5.26 |
| 45011.270833333336 | 6.53 |
| 45011.28125 | 7.72 |
| 45011.291666666664 | 7.03 |
| 45011.302083333336 | 8.33 |
| 45011.3125 | 7.78 |
| 45011.322916666664 | 6.98 |
| 45011.333333333336 | 6.88 |
| 45011.34375 | 8.49 |
| 45011.354166666664 | 8.94 |
| 45011.364583333336 | 9.41 |
| 45011.375 | 10.3 |
| 45011.385416666664 | 11.37 |
| 45011.395833333336 | 12.72 |
| 45011.40625 | 11.22 |
| 45011.416666666664 | 12.09 |
| 45011.427083333336 | 12.14 |
| 45011.4375 | 11.08 |
| 45011.447916666664 | 9.91 |
| 45011.458333333336 | 8.73 |
| 45011.46875 | 8.31 |
| 45011.479166666664 | 29.43 |
| 45011.489583333336 | 7.88 |
| 45011.5 | 7.99 |
| 45011.510416666664 | 8.32 |
| 45011.520833333336 | 8.81 |
| 45011.53125 | 8.07 |
| 45011.541666666664 | 7.94 |
| 45011.552083333336 | 7.86 |
| 45011.5625 | 7.85 |
| 45011.572916666664 | 6.93 |
| 45011.583333333336 | 6.34 |
| 45011.59375 | 6.11 |
| 45011.604166666664 | 6.2 |
| 45011.614583333336 | 5.88 |
| 45011.625 | 5.79 |
| 45011.635416666664 | 5.32 |
| 45011.645833333336 | 5.25 |
| 45011.65625 | 5.18 |
| 45011.666666666664 | 4.91 |
| 45011.677083333336 | 5.17 |
| 45011.6875 | 4.86 |
| 45011.697916666664 | 4.88 |
| 45011.708333333336 | 4.76 |
| 45011.71875 | 4.27 |
| 45011.729166666664 | 4.68 |
| 45011.739583333336 | 4.48 |
| 45011.75 | 4.63 |
| 45011.760416666664 | 5 |
| 45011.770833333336 | 5.64 |
| 45011.78125 | 6.7 |
| 45011.791666666664 | 7.05 |
| 45011.802083333336 | 8.26 |
| 45011.8125 | 7.17 |
| 45011.822916666664 | 7.77 |
| 45011.833333333336 | 9.84 |
| 45011.84375 | 9.09 |
| 45011.854166666664 | 9.04 |
| 45011.864583333336 | 9.16 |
| 45011.875 | 9.16 |
| 45011.885416666664 | 9.3 |
| 45011.895833333336 | 8.62 |
| 45011.90625 | 9.09 |
| 45011.916666666664 | 8.06 |
| 45011.927083333336 | 8.81 |
| 45011.9375 | 7.55 |
| 45011.947916666664 | 7.34 |
| 45011.958333333336 | 7.19 |
| 45011.96875 | 7.08 |
| 45011.979166666664 | 7.09 |
| 45011.989583333336 | 6.94 |
| 45012.0 | 7.9 |
| 45012.010416666664 | 7.45 |
| 45012.020833333336 | 7.55 |
| 45012.03125 | 7.8 |
| 45012.041666666664 | 7.37 |
| 45012.052083333336 | 7.67 |
| 45012.0625 | 7.22 |
| 45012.072916666664 | 6.32 |
| 45012.083333333336 | 6.36 |
| 45012.09375 | 5.96 |
| 45012.104166666664 | 5.6 |
| 45012.114583333336 | 5.52 |
| 45012.125 | 5.16 |
| 45012.135416666664 | 5.38 |
| 45012.145833333336 | 5.16 |
| 45012.15625 | 5.27 |
| 45012.166666666664 | 5.07 |
| 45012.177083333336 | 4.76 |
| 45012.1875 | 4.6 |
| 45012.197916666664 | 4.81 |
| 45012.208333333336 | 4.63 |
| 45012.21875 | 4.36 |
| 45012.229166666664 | 4.73 |
| 45012.239583333336 | 4.42 |
| 45012.25 | 5.14 |
| 45012.260416666664 | 4.55 |
| 45012.270833333336 | 4.47 |
| 45012.28125 | 4.47 |
| 45012.291666666664 | 4.62 |
| 45012.302083333336 | 5.21 |
| 45012.3125 | 6.75 |
| 45012.322916666664 | 8 |
| 45012.333333333336 | 8.52 |
| 45012.34375 | 10.6 |
| 45012.354166666664 | 8.37 |
| 45012.364583333336 | 10.18 |
| 45012.375 | 10.09 |
| 45012.385416666664 | 11.53 |
| 45012.395833333336 | 11.34 |
| 45012.40625 | 11.41 |
| 45012.416666666664 | 11.05 |
| 45012.427083333336 | 10.03 |
| 45012.4375 | 9.71 |
| 45012.447916666664 | 9.32 |
| 45012.458333333336 | 8.96 |
| 45012.46875 | 8.39 |
| 45012.479166666664 | 8.17 |
| 45012.489583333336 | 7.92 |
| 45012.5 | 7.95 |
| 45012.510416666664 | 8.12 |
| 45012.520833333336 | 7.57 |
| 45012.53125 | 7.34 |
| 45012.541666666664 | 7.52 |
| 45012.552083333336 | 7.98 |
| 45012.5625 | 7.51 |
| 45012.572916666664 | 7.48 |
| 45012.583333333336 | 7.5 |
| 45012.59375 | 6.95 |
| 45012.604166666664 | 7.07 |
| 45012.614583333336 | 6.95 |
| 45012.625 | 6.66 |
| 45012.635416666664 | 7.26 |
| 45012.645833333336 | 6.84 |
| 45012.65625 | 6.82 |
| 45012.666666666664 | 7.03 |
| 45012.677083333336 | 6.78 |
| 45012.6875 | 6.99 |
| 45012.697916666664 | 6.95 |
| 45012.708333333336 | 6.71 |
| 45012.71875 | 6.49 |
| 45012.729166666664 | 6.27 |
| 45012.739583333336 | 5.97 |
| 45012.75 | 5.67 |
| 45012.760416666664 | 5.41 |
| 45012.770833333336 | 5.42 |
| 45012.78125 | 5.46 |
| 45012.791666666664 | 5.98 |
| 45012.802083333336 | 6.31 |
| 45012.8125 | 7.2 |
| 45012.822916666664 | 6.77 |
| 45012.833333333336 | 7.2 |
| 45012.84375 | 8.53 |
| 45012.854166666664 | 7.04 |
| 45012.864583333336 | 8.06 |
| 45012.875 | 7.61 |
| 45012.885416666664 | 7.78 |
| 45012.895833333336 | 7.74 |
| 45012.90625 | 7.5 |
| 45012.916666666664 | 7.4 |
| 45012.927083333336 | 7.38 |
| 45012.9375 | 6.93 |
| 45012.947916666664 | 6.82 |
| 45012.958333333336 | 6.67 |
| 45012.96875 | 6.64 |
| 45012.979166666664 | 6.57 |
| 45012.989583333336 | 6.52 |
| 45013.0 | 6.67 |
| 45013.010416666664 | 6.52 |
| 45013.020833333336 | 6.49 |
| 45013.03125 | 6.92 |
| 45013.041666666664 | 6.72 |
| 45013.052083333336 | 6.55 |
| 45013.0625 | 6.65 |
| 45013.072916666664 | 6.54 |
| 45013.083333333336 | 6.34 |
| 45013.09375 | 6.52 |
| 45013.104166666664 | 6.18 |
| 45013.114583333336 | 5.87 |
| 45013.125 | 5.47 |
| 45013.135416666664 | 5.63 |
| 45013.145833333336 | 5.39 |
| 45013.15625 | 5.16 |
| 45013.166666666664 | 5.17 |
| 45013.177083333336 | 5.15 |
| 45013.1875 | 4.66 |
| 45013.197916666664 | 4.97 |
| 45013.208333333336 | 4.86 |
| 45013.21875 | 4.86 |
| 45013.229166666664 | 4.72 |
| 45013.239583333336 | 4.58 |
| 45013.25 | 4.56 |
| 45013.260416666664 | 4.52 |
| 45013.270833333336 | 4.32 |
| 45013.28125 | 4.46 |
| 45013.291666666664 | 4.51 |
| 45013.302083333336 | 4.3 |
| 45013.3125 | 4.36 |
| 45013.322916666664 | 4.53 |
| 45013.333333333336 | 4.98 |
| 45013.34375 | 5.33 |
| 45013.354166666664 | 5.6 |
| 45013.364583333336 | 6.01 |
| 45013.375 | 6.13 |
| 45013.385416666664 | 6.7 |
| 45013.395833333336 | 6.16 |
| 45013.40625 | 7 |
| 45013.416666666664 | 6.98 |
| 45013.427083333336 | 6.62 |
| 45013.4375 | 6.94 |
| 45013.447916666664 | 6.76 |
| 45013.458333333336 | 6.73 |
| 45013.46875 | 6.8 |
| 45013.479166666664 | 7.14 |
| 45013.489583333336 | 6.8 |
| 45013.5 | 7.18 |
| 45013.510416666664 | 7.08 |
| 45013.520833333336 | 6.87 |
| 45013.53125 | 6.79 |
| 45013.541666666664 | 6.56 |
| 45013.552083333336 | 6.69 |
| 45013.5625 | 6.92 |
| 45013.572916666664 | 6.95 |
| 45013.583333333336 | 7.11 |
| 45013.59375 | 6.96 |
| 45013.604166666664 | 6.89 |
| 45013.614583333336 | 6.52 |
| 45013.625 | 6.03 |
| 45013.635416666664 | 5.99 |
| 45013.645833333336 | 5.85 |
| 45013.65625 | 5.94 |
| 45013.666666666664 | 5.69 |
| 45013.677083333336 | 5.37 |
| 45013.6875 | 5.28 |
| 45013.697916666664 | 5.39 |
| 45013.708333333336 | 5.2 |
| 45013.71875 | 4.98 |
| 45013.729166666664 | 4.71 |
| 45013.739583333336 | 4.79 |
| 45013.75 | 4.47 |
| 45013.760416666664 | 4.48 |
| 45013.770833333336 | 4.57 |
| 45013.78125 | 4.46 |
| 45013.791666666664 | 4.26 |
| 45013.802083333336 | 4.1 |
| 45013.8125 | 4.24 |
| 45013.822916666664 | 4.17 |
| 45013.833333333336 | 4.53 |
| 45013.84375 | 4.98 |
| 45013.854166666664 | 5.44 |
| 45013.864583333336 | 5.81 |
| 45013.875 | 6.57 |
| 45013.885416666664 | 7.16 |
| 45013.895833333336 | 7.46 |
| 45013.90625 | 7.9 |
| 45013.916666666664 | 8.06 |
| 45013.927083333336 | 7.63 |
| 45013.9375 | 6.89 |
| 45013.947916666664 | 6.64 |
| 45013.958333333336 | 6.61 |
| 45013.96875 | 6.52 |
| 45013.979166666664 | 6.43 |
| 45013.989583333336 | 6.37 |
| 45014.0 | 6.2 |
| 45014.010416666664 | 6.13 |
| 45014.020833333336 | 6.38 |
| 45014.03125 | 6.27 |
| 45014.041666666664 | 6.27 |
| 45014.052083333336 | 6.29 |
| 45014.0625 | 6.35 |
| 45014.072916666664 | 6.24 |
| 45014.083333333336 | 6.03 |
| 45014.09375 | 6.24 |
| 45014.104166666664 | 6.21 |
| 45014.114583333336 | 6.01 |
| 45014.125 | 6.3 |
| 45014.135416666664 | 6.19 |
| 45014.145833333336 | 5.83 |
| 45014.15625 | 5.74 |
| 45014.166666666664 | 5.32 |
| 45014.177083333336 | 5.29 |
| 45014.1875 | 5.34 |
| 45014.197916666664 | 5.44 |
| 45014.208333333336 | 5.23 |
| 45014.21875 | 5.12 |
| 45014.229166666664 | 5.22 |
| 45014.239583333336 | 4.89 |
| 45014.25 | 5.01 |
| 45014.260416666664 | 4.81 |
| 45014.270833333336 | 4.79 |
| 45014.28125 | 4.51 |
| 45014.291666666664 | 4.19 |
| 45014.302083333336 | 4.13 |
| 45014.3125 | 4.37 |
| 45014.322916666664 | 4.27 |
| 45014.333333333336 | 4.04 |
| 45014.34375 | 3.97 |
| 45014.354166666664 | 4.04 |
| 45014.364583333336 | 4.15 |
| 45014.375 | 4.41 |
| 45014.385416666664 | 4.52 |
| 45014.395833333336 | 4.76 |
| 45014.40625 | 4.57 |
| 45014.416666666664 | 5.07 |
| 45014.427083333336 | 5 |
| 45014.4375 | 5.41 |
| 45014.447916666664 | 5.98 |
| 45014.458333333336 | 6.16 |
| 45014.46875 | 7.01 |
| 45014.479166666664 | 7.04 |
| 45014.489583333336 | 7.43 |
| 45014.5 | 8.19 |
| 45014.510416666664 | 8.02 |
| 45014.520833333336 | 8.16 |
| 45014.53125 | 7.7 |
| 45014.541666666664 | 7.47 |
| 45014.552083333336 | 7.3 |
| 45014.5625 | 7.11 |
| 45014.572916666664 | 7.13 |
| 45014.583333333336 | 6.84 |
| 45014.59375 | 6.73 |
| 45014.604166666664 | 6.7 |
| 45014.614583333336 | 6.63 |
| 45014.625 | 6.83 |
| 45014.635416666664 | 6.69 |
| 45014.645833333336 | 6.47 |
| 45014.65625 | 6.42 |
| 45014.666666666664 | 6.32 |
| 45014.677083333336 | 6.12 |
| 45014.6875 | 5.81 |
| 45014.697916666664 | 5.51 |
| 45014.708333333336 | 5.16 |
| 45014.71875 | 4.93 |
| 45014.729166666664 | 4.84 |
| 45014.739583333336 | 4.74 |
| 45014.75 | 4.54 |
| 45014.760416666664 | 4.38 |
| 45014.770833333336 | 4.6 |
| 45014.78125 | 4.4 |
| 45014.791666666664 | 4.49 |
| 45014.802083333336 | 4.42 |
| 45014.8125 | 4.31 |
| 45014.822916666664 | 4.24 |
| 45014.833333333336 | 4.44 |
| 45014.84375 | 4.16 |
| 45014.854166666664 | 4.6 |
| 45014.864583333336 | 5.33 |
| 45014.875 | 5.47 |
| 45014.885416666664 | 6.42 |
| 45014.895833333336 | 7.92 |
| 45014.90625 | 9.33 |
| 45014.916666666664 | 8.76 |
| 45014.927083333336 | 9.07 |
| 45014.9375 | 8.62 |
| 45014.947916666664 | 8.58 |
| 45014.958333333336 | 8.01 |
| 45014.96875 | 7.93 |
| 45014.979166666664 | 7.24 |
| 45014.989583333336 | 7.12 |
| 45015.0 | 7.56 |
| 45015.010416666664 | 7.17 |
| 45015.020833333336 | 6.73 |
| 45015.03125 | 6.35 |
| 45015.041666666664 | 6.39 |
| 45015.052083333336 | 6.31 |
| 45015.0625 | 6.44 |
| 45015.072916666664 | 6.3 |
| 45015.083333333336 | 6.34 |
| 45015.09375 | 6.44 |
| 45015.104166666664 | 6.84 |
| 45015.114583333336 | 6.79 |
| 45015.125 | 6.49 |
| 45015.135416666664 | 7.29 |
| 45015.145833333336 | 7.35 |
| 45015.15625 | 7.61 |
| 45015.166666666664 | 8.21 |
| 45015.177083333336 | 9.02 |
| 45015.1875 | 9.44 |
| 45015.197916666664 | 9.62 |
| 45015.208333333336 | 9.43 |
| 45015.21875 | 9.64 |
| 45015.229166666664 | 8.97 |
| 45015.239583333336 | 8.75 |
| 45015.25 | 8.38 |
| 45015.260416666664 | 12.38 |
| 45015.270833333336 | 8.12 |
| 45015.28125 | 7.83 |
| 45015.291666666664 | 7.57 |
| 45015.302083333336 | 7.35 |
| 45015.3125 | 7.03 |
| 45015.322916666664 | 6.58 |
| 45015.333333333336 | 6.91 |
| 45015.34375 | 6.84 |
| 45015.354166666664 | 6.19 |
| 45015.364583333336 | 6.64 |
| 45015.375 | 6.32 |
| 45015.385416666664 | 5.73 |
| 45015.395833333336 | 5.94 |
| 45015.40625 | 6.03 |
| 45015.416666666664 | 6.5 |
| 45015.427083333336 | 6.57 |
| 45015.4375 | 6.71 |
| 45015.447916666664 | 6.78 |
| 45015.458333333336 | 6.43 |
| 45015.46875 | 7.21 |
| 45015.479166666664 | 6.96 |
| 45015.489583333336 | 7.86 |
| 45015.5 | 8.39 |
| 45015.510416666664 | 9.38 |
| 45015.520833333336 | 9.28 |
| 45015.53125 | 9.14 |
| 45015.541666666664 | 8.73 |
| 45015.552083333336 | 8.49 |
| 45015.5625 | 8.39 |
| 45015.572916666664 | 7.95 |
| 45015.583333333336 | 8.14 |
| 45015.59375 | 7.58 |
| 45015.604166666664 | 7.26 |
| 45015.614583333336 | 7.65 |
| 45015.625 | 7.02 |
| 45015.635416666664 | 7.11 |
| 45015.645833333336 | 6.67 |
| 45015.65625 | 7.17 |
| 45015.666666666664 | 7.09 |
| 45015.677083333336 | 6.82 |
| 45015.6875 | 6.85 |
| 45015.697916666664 | 7.01 |
| 45015.708333333336 | 6.53 |
| 45015.71875 | 6.29 |
| 45015.729166666664 | 6.31 |
| 45015.739583333336 | 6.07 |
| 45015.75 | 5.95 |
| 45015.760416666664 | 5.72 |
| 45015.770833333336 | 5.6 |
| 45015.78125 | 5.45 |
| 45015.791666666664 | 5.15 |
| 45015.802083333336 | 5.1 |
| 45015.8125 | 5.38 |
| 45015.822916666664 | 4.96 |
| 45015.833333333336 | 5.29 |
| 45015.84375 | 5.07 |
| 45015.854166666664 | 4.86 |
| 45015.864583333336 | 4.75 |
| 45015.875 | 4.89 |
| 45015.885416666664 | 4.48 |
| 45015.895833333336 | 4.61 |
| 45015.90625 | 4.48 |
| 45015.916666666664 | 4.69 |
| 45015.927083333336 | 4.9 |
| 45015.9375 | 5.53 |
| 45015.947916666664 | 5.91 |
| 45015.958333333336 | 5.87 |
| 45015.96875 | 6.42 |
| 45015.979166666664 | 6.45 |
| 45015.989583333336 | 7 |
| 45016.0 | 7.26 |
| 45016.010416666664 | 6.9 |
| 45016.020833333336 | 7.12 |
| 45016.03125 | 7.17 |
| 45016.041666666664 | 6.89 |
| 45016.052083333336 | 6.64 |
| 45016.0625 | 6.49 |
| 45016.072916666664 | 6.48 |
| 45016.083333333336 | 6.58 |
| 45016.09375 | 6.79 |
| 45016.104166666664 | 6.69 |
| 45016.114583333336 | 6.79 |
| 45016.125 | 6.63 |
| 45016.135416666664 | 6.67 |
| 45016.145833333336 | 6.29 |
| 45016.15625 | 6.27 |
| 45016.166666666664 | 6.51 |
| 45016.177083333336 | 6.34 |
| 45016.1875 | 6.61 |
| 45016.197916666664 | 6.43 |
| 45016.208333333336 | 6.62 |
| 45016.21875 | 6.55 |
| 45016.229166666664 | 6.83 |
| 45016.239583333336 | 6.69 |
| 45016.25 | 7.01 |
| 45016.260416666664 | 6.75 |
| 45016.270833333336 | 6.51 |
| 45016.28125 | 6.47 |
| 45016.291666666664 | 6.26 |
| 45016.302083333336 | 6.25 |
| 45016.3125 | 5.87 |
| 45016.322916666664 | 5.72 |
| 45016.333333333336 | 5.29 |
| 45016.34375 | 5.29 |
| 45016.354166666664 | 5.12 |
| 45016.364583333336 | 4.59 |
| 45016.375 | 4.67 |
| 45016.385416666664 | 4.8 |
| 45016.395833333336 | 4.55 |
| 45016.40625 | 4.91 |
| 45016.416666666664 | 4.8 |
| 45016.427083333336 | 4.49 |
| 45016.4375 | 4.65 |
| 45016.447916666664 | 4.63 |
| 45016.458333333336 | 5.35 |
| 45016.46875 | 5.8 |
| 45016.479166666664 | 5.73 |
| 45016.489583333336 | 6.21 |
| 45016.5 | 6.92 |
| 45016.510416666664 | 6.86 |
| 45016.520833333336 | 6.96 |
| 45016.53125 | 6.96 |
| 45016.541666666664 | 7.2 |
| 45016.552083333336 | 7.31 |
| 45016.5625 | 7.08 |
| 45016.572916666664 | 7.14 |
| 45016.583333333336 | 7.1 |
| 45016.59375 | 6.77 |
| 45016.604166666664 | 6.85 |
| 45016.614583333336 | 6.6 |
| 45016.625 | 6.4 |
| 45016.635416666664 | 6.57 |
| 45016.645833333336 | 6.66 |
| 45016.65625 | 6.4 |
| 45016.666666666664 | 6.43 |
| 45016.677083333336 | 6.53 |
| 45016.6875 | 7.83 |
| 45016.697916666664 | 13.68 |
| 45016.708333333336 | 9.16 |
| 45016.71875 | 7.66 |
| 45016.729166666664 | 8.03 |
| 45016.739583333336 | 8.88 |
| 45016.75 | 10.13 |
| 45016.760416666664 | 10.28 |
| 45016.770833333336 | 9.9 |
| 45016.78125 | 9.91 |
| 45016.791666666664 | 10.55 |
| 45016.802083333336 | 10.45 |
| 45016.8125 | 9.99 |
| 45016.822916666664 | 9.88 |
| 45016.833333333336 | 8.99 |
| 45016.84375 | 8.53 |
| 45016.854166666664 | 8.24 |
| 45016.864583333336 | 7.56 |
| 45016.875 | 7.43 |
| 45016.885416666664 | 7.15 |
| 45016.895833333336 | 6.83 |
| 45016.90625 | 6.9 |
| 45016.916666666664 | 6.41 |
| 45016.927083333336 | 6.57 |
| 45016.9375 | 6.34 |
| 45016.947916666664 | 6.16 |
| 45016.958333333336 | 5.92 |
| 45016.96875 | 5.93 |
| 45016.979166666664 | 6.08 |
| 45016.989583333336 | 6.31 |
| 45017.0 | 6.21 |
| 45017.010416666664 | 6.45 |
| 45017.020833333336 | 6.75 |
| 45017.03125 | 6.52 |
| 45017.041666666664 | 7.38 |
| 45017.052083333336 | 7.07 |
| 45017.0625 | 7.21 |
| 45017.072916666664 | 7.25 |
| 45017.083333333336 | 7.99 |
| 45017.09375 | 8.4 |
| 45017.104166666664 | 7.51 |
| 45017.114583333336 | 7.93 |
| 45017.125 | 8.88 |
| 45017.135416666664 | 9.19 |
| 45017.145833333336 | 8.14 |